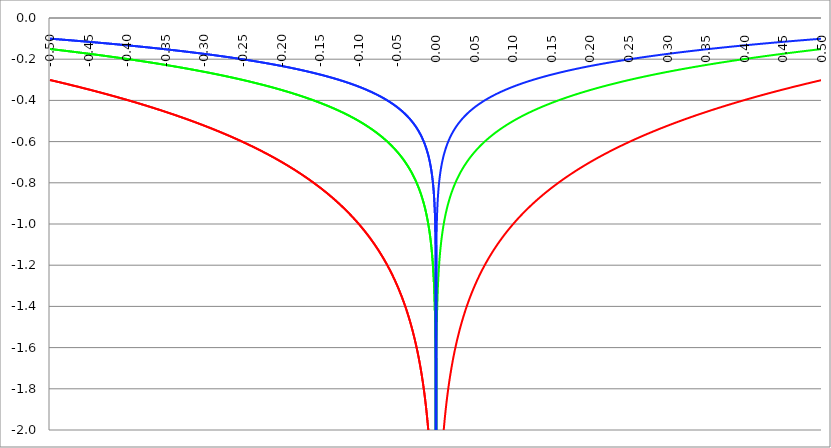
| Category | Series 1 | Series 0 | Series 2 |
|---|---|---|---|
| -0.5 | -0.301 | -0.151 | -0.1 |
| -0.4995 | -0.301 | -0.151 | -0.1 |
| -0.499 | -0.302 | -0.151 | -0.101 |
| -0.4985 | -0.302 | -0.151 | -0.101 |
| -0.498 | -0.303 | -0.151 | -0.101 |
| -0.4975 | -0.303 | -0.152 | -0.101 |
| -0.497 | -0.304 | -0.152 | -0.101 |
| -0.4965 | -0.304 | -0.152 | -0.101 |
| -0.496 | -0.305 | -0.152 | -0.102 |
| -0.4955 | -0.305 | -0.152 | -0.102 |
| -0.495 | -0.305 | -0.153 | -0.102 |
| -0.4945 | -0.306 | -0.153 | -0.102 |
| -0.494 | -0.306 | -0.153 | -0.102 |
| -0.4935 | -0.307 | -0.153 | -0.102 |
| -0.493 | -0.307 | -0.154 | -0.102 |
| -0.4925 | -0.308 | -0.154 | -0.103 |
| -0.492 | -0.308 | -0.154 | -0.103 |
| -0.4915 | -0.308 | -0.154 | -0.103 |
| -0.491 | -0.309 | -0.154 | -0.103 |
| -0.4905 | -0.309 | -0.155 | -0.103 |
| -0.49 | -0.31 | -0.155 | -0.103 |
| -0.4895 | -0.31 | -0.155 | -0.103 |
| -0.489 | -0.311 | -0.155 | -0.104 |
| -0.4885 | -0.311 | -0.156 | -0.104 |
| -0.488 | -0.312 | -0.156 | -0.104 |
| -0.4875 | -0.312 | -0.156 | -0.104 |
| -0.487 | -0.312 | -0.156 | -0.104 |
| -0.4865 | -0.313 | -0.156 | -0.104 |
| -0.486 | -0.313 | -0.157 | -0.104 |
| -0.4855 | -0.314 | -0.157 | -0.105 |
| -0.485 | -0.314 | -0.157 | -0.105 |
| -0.4845 | -0.315 | -0.157 | -0.105 |
| -0.484 | -0.315 | -0.158 | -0.105 |
| -0.4835 | -0.316 | -0.158 | -0.105 |
| -0.483 | -0.316 | -0.158 | -0.105 |
| -0.4825 | -0.317 | -0.158 | -0.106 |
| -0.482 | -0.317 | -0.158 | -0.106 |
| -0.4815 | -0.317 | -0.159 | -0.106 |
| -0.481 | -0.318 | -0.159 | -0.106 |
| -0.4805 | -0.318 | -0.159 | -0.106 |
| -0.48 | -0.319 | -0.159 | -0.106 |
| -0.4795 | -0.319 | -0.16 | -0.106 |
| -0.479 | -0.32 | -0.16 | -0.107 |
| -0.4785 | -0.32 | -0.16 | -0.107 |
| -0.478 | -0.321 | -0.16 | -0.107 |
| -0.4775 | -0.321 | -0.161 | -0.107 |
| -0.477 | -0.321 | -0.161 | -0.107 |
| -0.4765 | -0.322 | -0.161 | -0.107 |
| -0.476 | -0.322 | -0.161 | -0.107 |
| -0.4755 | -0.323 | -0.161 | -0.108 |
| -0.475 | -0.323 | -0.162 | -0.108 |
| -0.4745 | -0.324 | -0.162 | -0.108 |
| -0.474 | -0.324 | -0.162 | -0.108 |
| -0.4735 | -0.325 | -0.162 | -0.108 |
| -0.473 | -0.325 | -0.163 | -0.108 |
| -0.4725 | -0.326 | -0.163 | -0.109 |
| -0.472 | -0.326 | -0.163 | -0.109 |
| -0.4715 | -0.327 | -0.163 | -0.109 |
| -0.471 | -0.327 | -0.163 | -0.109 |
| -0.4705 | -0.327 | -0.164 | -0.109 |
| -0.47 | -0.328 | -0.164 | -0.109 |
| -0.4695 | -0.328 | -0.164 | -0.109 |
| -0.469 | -0.329 | -0.164 | -0.11 |
| -0.4685 | -0.329 | -0.165 | -0.11 |
| -0.468 | -0.33 | -0.165 | -0.11 |
| -0.4675 | -0.33 | -0.165 | -0.11 |
| -0.467 | -0.331 | -0.165 | -0.11 |
| -0.4665 | -0.331 | -0.166 | -0.11 |
| -0.466 | -0.332 | -0.166 | -0.111 |
| -0.4655 | -0.332 | -0.166 | -0.111 |
| -0.465 | -0.333 | -0.166 | -0.111 |
| -0.4645 | -0.333 | -0.167 | -0.111 |
| -0.464 | -0.333 | -0.167 | -0.111 |
| -0.4635 | -0.334 | -0.167 | -0.111 |
| -0.463 | -0.334 | -0.167 | -0.111 |
| -0.4625 | -0.335 | -0.167 | -0.112 |
| -0.462 | -0.335 | -0.168 | -0.112 |
| -0.4615 | -0.336 | -0.168 | -0.112 |
| -0.461 | -0.336 | -0.168 | -0.112 |
| -0.4605 | -0.337 | -0.168 | -0.112 |
| -0.46 | -0.337 | -0.169 | -0.112 |
| -0.4595 | -0.338 | -0.169 | -0.113 |
| -0.459 | -0.338 | -0.169 | -0.113 |
| -0.4585 | -0.339 | -0.169 | -0.113 |
| -0.458 | -0.339 | -0.17 | -0.113 |
| -0.4575 | -0.34 | -0.17 | -0.113 |
| -0.457 | -0.34 | -0.17 | -0.113 |
| -0.4565 | -0.341 | -0.17 | -0.114 |
| -0.456 | -0.341 | -0.171 | -0.114 |
| -0.4555 | -0.342 | -0.171 | -0.114 |
| -0.455 | -0.342 | -0.171 | -0.114 |
| -0.4545 | -0.342 | -0.171 | -0.114 |
| -0.454 | -0.343 | -0.171 | -0.114 |
| -0.4535 | -0.343 | -0.172 | -0.114 |
| -0.453 | -0.344 | -0.172 | -0.115 |
| -0.4525 | -0.344 | -0.172 | -0.115 |
| -0.452 | -0.345 | -0.172 | -0.115 |
| -0.4515 | -0.345 | -0.173 | -0.115 |
| -0.451 | -0.346 | -0.173 | -0.115 |
| -0.4505 | -0.346 | -0.173 | -0.115 |
| -0.45 | -0.347 | -0.173 | -0.116 |
| -0.4495 | -0.347 | -0.174 | -0.116 |
| -0.449 | -0.348 | -0.174 | -0.116 |
| -0.4485 | -0.348 | -0.174 | -0.116 |
| -0.448 | -0.349 | -0.174 | -0.116 |
| -0.4475 | -0.349 | -0.175 | -0.116 |
| -0.447 | -0.35 | -0.175 | -0.117 |
| -0.4465 | -0.35 | -0.175 | -0.117 |
| -0.446 | -0.351 | -0.175 | -0.117 |
| -0.4455 | -0.351 | -0.176 | -0.117 |
| -0.445 | -0.352 | -0.176 | -0.117 |
| -0.4445 | -0.352 | -0.176 | -0.117 |
| -0.444 | -0.353 | -0.176 | -0.118 |
| -0.4435 | -0.353 | -0.177 | -0.118 |
| -0.443 | -0.354 | -0.177 | -0.118 |
| -0.4425 | -0.354 | -0.177 | -0.118 |
| -0.442 | -0.355 | -0.177 | -0.118 |
| -0.4415 | -0.355 | -0.178 | -0.118 |
| -0.441 | -0.356 | -0.178 | -0.119 |
| -0.4405 | -0.356 | -0.178 | -0.119 |
| -0.44 | -0.357 | -0.178 | -0.119 |
| -0.4395 | -0.357 | -0.179 | -0.119 |
| -0.439 | -0.358 | -0.179 | -0.119 |
| -0.4385 | -0.358 | -0.179 | -0.119 |
| -0.438 | -0.359 | -0.179 | -0.12 |
| -0.4375 | -0.359 | -0.18 | -0.12 |
| -0.437 | -0.36 | -0.18 | -0.12 |
| -0.4365 | -0.36 | -0.18 | -0.12 |
| -0.436 | -0.361 | -0.18 | -0.12 |
| -0.4355 | -0.361 | -0.181 | -0.12 |
| -0.435 | -0.362 | -0.181 | -0.121 |
| -0.4345 | -0.362 | -0.181 | -0.121 |
| -0.434 | -0.363 | -0.181 | -0.121 |
| -0.4335 | -0.363 | -0.182 | -0.121 |
| -0.433 | -0.364 | -0.182 | -0.121 |
| -0.4325 | -0.364 | -0.182 | -0.121 |
| -0.432 | -0.365 | -0.182 | -0.122 |
| -0.4315 | -0.365 | -0.183 | -0.122 |
| -0.431 | -0.366 | -0.183 | -0.122 |
| -0.4305 | -0.366 | -0.183 | -0.122 |
| -0.43 | -0.367 | -0.183 | -0.122 |
| -0.4295 | -0.367 | -0.184 | -0.122 |
| -0.429 | -0.368 | -0.184 | -0.123 |
| -0.4285 | -0.368 | -0.184 | -0.123 |
| -0.428 | -0.369 | -0.184 | -0.123 |
| -0.4275 | -0.369 | -0.185 | -0.123 |
| -0.427 | -0.37 | -0.185 | -0.123 |
| -0.4265 | -0.37 | -0.185 | -0.123 |
| -0.426 | -0.371 | -0.185 | -0.124 |
| -0.4255 | -0.371 | -0.186 | -0.124 |
| -0.425 | -0.372 | -0.186 | -0.124 |
| -0.4245 | -0.372 | -0.186 | -0.124 |
| -0.424 | -0.373 | -0.186 | -0.124 |
| -0.4235 | -0.373 | -0.187 | -0.124 |
| -0.423 | -0.374 | -0.187 | -0.125 |
| -0.4225 | -0.374 | -0.187 | -0.125 |
| -0.422 | -0.375 | -0.187 | -0.125 |
| -0.4215 | -0.375 | -0.188 | -0.125 |
| -0.421 | -0.376 | -0.188 | -0.125 |
| -0.4205 | -0.376 | -0.188 | -0.125 |
| -0.42 | -0.377 | -0.188 | -0.126 |
| -0.4195 | -0.377 | -0.189 | -0.126 |
| -0.419 | -0.378 | -0.189 | -0.126 |
| -0.4185 | -0.378 | -0.189 | -0.126 |
| -0.418 | -0.379 | -0.189 | -0.126 |
| -0.4175 | -0.379 | -0.19 | -0.126 |
| -0.417 | -0.38 | -0.19 | -0.127 |
| -0.4165 | -0.38 | -0.19 | -0.127 |
| -0.416 | -0.381 | -0.19 | -0.127 |
| -0.4155 | -0.381 | -0.191 | -0.127 |
| -0.415 | -0.382 | -0.191 | -0.127 |
| -0.4145 | -0.382 | -0.191 | -0.127 |
| -0.414 | -0.383 | -0.191 | -0.128 |
| -0.4135 | -0.384 | -0.192 | -0.128 |
| -0.413 | -0.384 | -0.192 | -0.128 |
| -0.4125 | -0.385 | -0.192 | -0.128 |
| -0.412 | -0.385 | -0.193 | -0.128 |
| -0.4115 | -0.386 | -0.193 | -0.129 |
| -0.411 | -0.386 | -0.193 | -0.129 |
| -0.4105 | -0.387 | -0.193 | -0.129 |
| -0.41 | -0.387 | -0.194 | -0.129 |
| -0.4095 | -0.388 | -0.194 | -0.129 |
| -0.409 | -0.388 | -0.194 | -0.129 |
| -0.4085 | -0.389 | -0.194 | -0.13 |
| -0.408 | -0.389 | -0.195 | -0.13 |
| -0.4075 | -0.39 | -0.195 | -0.13 |
| -0.407 | -0.39 | -0.195 | -0.13 |
| -0.4065 | -0.391 | -0.195 | -0.13 |
| -0.406 | -0.391 | -0.196 | -0.13 |
| -0.4055 | -0.392 | -0.196 | -0.131 |
| -0.405 | -0.393 | -0.196 | -0.131 |
| -0.4045 | -0.393 | -0.197 | -0.131 |
| -0.404 | -0.394 | -0.197 | -0.131 |
| -0.4035 | -0.394 | -0.197 | -0.131 |
| -0.403 | -0.395 | -0.197 | -0.132 |
| -0.4025 | -0.395 | -0.198 | -0.132 |
| -0.402 | -0.396 | -0.198 | -0.132 |
| -0.4015 | -0.396 | -0.198 | -0.132 |
| -0.401 | -0.397 | -0.198 | -0.132 |
| -0.4005 | -0.397 | -0.199 | -0.132 |
| -0.4 | -0.398 | -0.199 | -0.133 |
| -0.3995 | -0.398 | -0.199 | -0.133 |
| -0.399 | -0.399 | -0.2 | -0.133 |
| -0.3985 | -0.4 | -0.2 | -0.133 |
| -0.398 | -0.4 | -0.2 | -0.133 |
| -0.3975 | -0.401 | -0.2 | -0.134 |
| -0.397 | -0.401 | -0.201 | -0.134 |
| -0.3965 | -0.402 | -0.201 | -0.134 |
| -0.396 | -0.402 | -0.201 | -0.134 |
| -0.3955 | -0.403 | -0.201 | -0.134 |
| -0.395 | -0.403 | -0.202 | -0.134 |
| -0.3945 | -0.404 | -0.202 | -0.135 |
| -0.394 | -0.405 | -0.202 | -0.135 |
| -0.3935 | -0.405 | -0.203 | -0.135 |
| -0.393 | -0.406 | -0.203 | -0.135 |
| -0.3925 | -0.406 | -0.203 | -0.135 |
| -0.392 | -0.407 | -0.203 | -0.136 |
| -0.3915 | -0.407 | -0.204 | -0.136 |
| -0.391 | -0.408 | -0.204 | -0.136 |
| -0.3905 | -0.408 | -0.204 | -0.136 |
| -0.39 | -0.409 | -0.204 | -0.136 |
| -0.3895 | -0.409 | -0.205 | -0.136 |
| -0.389 | -0.41 | -0.205 | -0.137 |
| -0.3885 | -0.411 | -0.205 | -0.137 |
| -0.388 | -0.411 | -0.206 | -0.137 |
| -0.3875 | -0.412 | -0.206 | -0.137 |
| -0.387 | -0.412 | -0.206 | -0.137 |
| -0.3865 | -0.413 | -0.206 | -0.138 |
| -0.386 | -0.413 | -0.207 | -0.138 |
| -0.3855 | -0.414 | -0.207 | -0.138 |
| -0.385 | -0.415 | -0.207 | -0.138 |
| -0.3845 | -0.415 | -0.208 | -0.138 |
| -0.384 | -0.416 | -0.208 | -0.139 |
| -0.3835 | -0.416 | -0.208 | -0.139 |
| -0.383 | -0.417 | -0.208 | -0.139 |
| -0.3825 | -0.417 | -0.209 | -0.139 |
| -0.382 | -0.418 | -0.209 | -0.139 |
| -0.3815 | -0.419 | -0.209 | -0.14 |
| -0.381 | -0.419 | -0.21 | -0.14 |
| -0.3805 | -0.42 | -0.21 | -0.14 |
| -0.38 | -0.42 | -0.21 | -0.14 |
| -0.3795 | -0.421 | -0.21 | -0.14 |
| -0.379 | -0.421 | -0.211 | -0.14 |
| -0.3785 | -0.422 | -0.211 | -0.141 |
| -0.378 | -0.423 | -0.211 | -0.141 |
| -0.3775 | -0.423 | -0.212 | -0.141 |
| -0.377 | -0.424 | -0.212 | -0.141 |
| -0.3765 | -0.424 | -0.212 | -0.141 |
| -0.376 | -0.425 | -0.212 | -0.142 |
| -0.3755 | -0.425 | -0.213 | -0.142 |
| -0.375 | -0.426 | -0.213 | -0.142 |
| -0.3745 | -0.427 | -0.213 | -0.142 |
| -0.374 | -0.427 | -0.214 | -0.142 |
| -0.3735 | -0.428 | -0.214 | -0.143 |
| -0.373 | -0.428 | -0.214 | -0.143 |
| -0.3725 | -0.429 | -0.214 | -0.143 |
| -0.372 | -0.429 | -0.215 | -0.143 |
| -0.3715 | -0.43 | -0.215 | -0.143 |
| -0.371 | -0.431 | -0.215 | -0.144 |
| -0.3705 | -0.431 | -0.216 | -0.144 |
| -0.37 | -0.432 | -0.216 | -0.144 |
| -0.3695 | -0.432 | -0.216 | -0.144 |
| -0.369 | -0.433 | -0.216 | -0.144 |
| -0.3685 | -0.434 | -0.217 | -0.145 |
| -0.368 | -0.434 | -0.217 | -0.145 |
| -0.3675 | -0.435 | -0.217 | -0.145 |
| -0.367 | -0.435 | -0.218 | -0.145 |
| -0.3665 | -0.436 | -0.218 | -0.145 |
| -0.366 | -0.437 | -0.218 | -0.146 |
| -0.3655 | -0.437 | -0.219 | -0.146 |
| -0.365 | -0.438 | -0.219 | -0.146 |
| -0.3645 | -0.438 | -0.219 | -0.146 |
| -0.364 | -0.439 | -0.219 | -0.146 |
| -0.3635 | -0.439 | -0.22 | -0.146 |
| -0.363 | -0.44 | -0.22 | -0.147 |
| -0.3625 | -0.441 | -0.22 | -0.147 |
| -0.362 | -0.441 | -0.221 | -0.147 |
| -0.3615 | -0.442 | -0.221 | -0.147 |
| -0.361 | -0.442 | -0.221 | -0.147 |
| -0.3605 | -0.443 | -0.222 | -0.148 |
| -0.36 | -0.444 | -0.222 | -0.148 |
| -0.3595 | -0.444 | -0.222 | -0.148 |
| -0.359 | -0.445 | -0.222 | -0.148 |
| -0.3585 | -0.446 | -0.223 | -0.149 |
| -0.358 | -0.446 | -0.223 | -0.149 |
| -0.3575 | -0.447 | -0.223 | -0.149 |
| -0.357 | -0.447 | -0.224 | -0.149 |
| -0.3565 | -0.448 | -0.224 | -0.149 |
| -0.356 | -0.449 | -0.224 | -0.15 |
| -0.3555 | -0.449 | -0.225 | -0.15 |
| -0.355 | -0.45 | -0.225 | -0.15 |
| -0.3545 | -0.45 | -0.225 | -0.15 |
| -0.354 | -0.451 | -0.225 | -0.15 |
| -0.3535 | -0.452 | -0.226 | -0.151 |
| -0.353 | -0.452 | -0.226 | -0.151 |
| -0.3525 | -0.453 | -0.226 | -0.151 |
| -0.352 | -0.453 | -0.227 | -0.151 |
| -0.3515 | -0.454 | -0.227 | -0.151 |
| -0.351 | -0.455 | -0.227 | -0.152 |
| -0.3505 | -0.455 | -0.228 | -0.152 |
| -0.35 | -0.456 | -0.228 | -0.152 |
| -0.3495 | -0.457 | -0.228 | -0.152 |
| -0.349 | -0.457 | -0.229 | -0.152 |
| -0.3485 | -0.458 | -0.229 | -0.153 |
| -0.348 | -0.458 | -0.229 | -0.153 |
| -0.3475 | -0.459 | -0.23 | -0.153 |
| -0.347 | -0.46 | -0.23 | -0.153 |
| -0.3465 | -0.46 | -0.23 | -0.153 |
| -0.346 | -0.461 | -0.23 | -0.154 |
| -0.3455 | -0.462 | -0.231 | -0.154 |
| -0.345 | -0.462 | -0.231 | -0.154 |
| -0.3445 | -0.463 | -0.231 | -0.154 |
| -0.344 | -0.463 | -0.232 | -0.154 |
| -0.3435 | -0.464 | -0.232 | -0.155 |
| -0.343 | -0.465 | -0.232 | -0.155 |
| -0.3425 | -0.465 | -0.233 | -0.155 |
| -0.342 | -0.466 | -0.233 | -0.155 |
| -0.3415 | -0.467 | -0.233 | -0.156 |
| -0.341 | -0.467 | -0.234 | -0.156 |
| -0.3405 | -0.468 | -0.234 | -0.156 |
| -0.34 | -0.469 | -0.234 | -0.156 |
| -0.3395 | -0.469 | -0.235 | -0.156 |
| -0.339 | -0.47 | -0.235 | -0.157 |
| -0.3385 | -0.47 | -0.235 | -0.157 |
| -0.338 | -0.471 | -0.236 | -0.157 |
| -0.3375 | -0.472 | -0.236 | -0.157 |
| -0.337 | -0.472 | -0.236 | -0.157 |
| -0.3365 | -0.473 | -0.237 | -0.158 |
| -0.336 | -0.474 | -0.237 | -0.158 |
| -0.3355 | -0.474 | -0.237 | -0.158 |
| -0.335 | -0.475 | -0.237 | -0.158 |
| -0.3345 | -0.476 | -0.238 | -0.159 |
| -0.334 | -0.476 | -0.238 | -0.159 |
| -0.3335 | -0.477 | -0.238 | -0.159 |
| -0.333 | -0.478 | -0.239 | -0.159 |
| -0.3325 | -0.478 | -0.239 | -0.159 |
| -0.332 | -0.479 | -0.239 | -0.16 |
| -0.3315 | -0.48 | -0.24 | -0.16 |
| -0.331 | -0.48 | -0.24 | -0.16 |
| -0.3305 | -0.481 | -0.24 | -0.16 |
| -0.33 | -0.481 | -0.241 | -0.16 |
| -0.3295 | -0.482 | -0.241 | -0.161 |
| -0.329 | -0.483 | -0.241 | -0.161 |
| -0.3285 | -0.483 | -0.242 | -0.161 |
| -0.328 | -0.484 | -0.242 | -0.161 |
| -0.3275 | -0.485 | -0.242 | -0.162 |
| -0.327 | -0.485 | -0.243 | -0.162 |
| -0.3265 | -0.486 | -0.243 | -0.162 |
| -0.326 | -0.487 | -0.243 | -0.162 |
| -0.3255 | -0.487 | -0.244 | -0.162 |
| -0.325 | -0.488 | -0.244 | -0.163 |
| -0.3245 | -0.489 | -0.244 | -0.163 |
| -0.324 | -0.489 | -0.245 | -0.163 |
| -0.3235 | -0.49 | -0.245 | -0.163 |
| -0.323 | -0.491 | -0.245 | -0.164 |
| -0.3225 | -0.491 | -0.246 | -0.164 |
| -0.322 | -0.492 | -0.246 | -0.164 |
| -0.3215 | -0.493 | -0.246 | -0.164 |
| -0.321 | -0.493 | -0.247 | -0.164 |
| -0.3205 | -0.494 | -0.247 | -0.165 |
| -0.32 | -0.495 | -0.247 | -0.165 |
| -0.3195 | -0.496 | -0.248 | -0.165 |
| -0.319 | -0.496 | -0.248 | -0.165 |
| -0.3185 | -0.497 | -0.248 | -0.166 |
| -0.318 | -0.498 | -0.249 | -0.166 |
| -0.3175 | -0.498 | -0.249 | -0.166 |
| -0.317 | -0.499 | -0.249 | -0.166 |
| -0.3165 | -0.5 | -0.25 | -0.167 |
| -0.316 | -0.5 | -0.25 | -0.167 |
| -0.3155 | -0.501 | -0.251 | -0.167 |
| -0.315 | -0.502 | -0.251 | -0.167 |
| -0.3145 | -0.502 | -0.251 | -0.167 |
| -0.314 | -0.503 | -0.252 | -0.168 |
| -0.3135 | -0.504 | -0.252 | -0.168 |
| -0.313 | -0.504 | -0.252 | -0.168 |
| -0.3125 | -0.505 | -0.253 | -0.168 |
| -0.312 | -0.506 | -0.253 | -0.169 |
| -0.3115 | -0.507 | -0.253 | -0.169 |
| -0.311 | -0.507 | -0.254 | -0.169 |
| -0.3105 | -0.508 | -0.254 | -0.169 |
| -0.31 | -0.509 | -0.254 | -0.17 |
| -0.3095 | -0.509 | -0.255 | -0.17 |
| -0.309 | -0.51 | -0.255 | -0.17 |
| -0.3085 | -0.511 | -0.255 | -0.17 |
| -0.308 | -0.511 | -0.256 | -0.17 |
| -0.3075 | -0.512 | -0.256 | -0.171 |
| -0.307 | -0.513 | -0.256 | -0.171 |
| -0.3065 | -0.514 | -0.257 | -0.171 |
| -0.306 | -0.514 | -0.257 | -0.171 |
| -0.3055 | -0.515 | -0.257 | -0.172 |
| -0.305 | -0.516 | -0.258 | -0.172 |
| -0.3045 | -0.516 | -0.258 | -0.172 |
| -0.304 | -0.517 | -0.259 | -0.172 |
| -0.3035 | -0.518 | -0.259 | -0.173 |
| -0.303 | -0.519 | -0.259 | -0.173 |
| -0.3025 | -0.519 | -0.26 | -0.173 |
| -0.302 | -0.52 | -0.26 | -0.173 |
| -0.3015 | -0.521 | -0.26 | -0.174 |
| -0.301 | -0.521 | -0.261 | -0.174 |
| -0.3005 | -0.522 | -0.261 | -0.174 |
| -0.3 | -0.523 | -0.261 | -0.174 |
| -0.2995 | -0.524 | -0.262 | -0.175 |
| -0.299 | -0.524 | -0.262 | -0.175 |
| -0.2985 | -0.525 | -0.263 | -0.175 |
| -0.298 | -0.526 | -0.263 | -0.175 |
| -0.2975 | -0.527 | -0.263 | -0.176 |
| -0.297 | -0.527 | -0.264 | -0.176 |
| -0.2965 | -0.528 | -0.264 | -0.176 |
| -0.296 | -0.529 | -0.264 | -0.176 |
| -0.2955 | -0.529 | -0.265 | -0.176 |
| -0.295 | -0.53 | -0.265 | -0.177 |
| -0.2945 | -0.531 | -0.265 | -0.177 |
| -0.294 | -0.532 | -0.266 | -0.177 |
| -0.2935 | -0.532 | -0.266 | -0.177 |
| -0.293 | -0.533 | -0.267 | -0.178 |
| -0.2925 | -0.534 | -0.267 | -0.178 |
| -0.292 | -0.535 | -0.267 | -0.178 |
| -0.2915 | -0.535 | -0.268 | -0.178 |
| -0.291 | -0.536 | -0.268 | -0.179 |
| -0.2905 | -0.537 | -0.268 | -0.179 |
| -0.29 | -0.538 | -0.269 | -0.179 |
| -0.2895 | -0.538 | -0.269 | -0.179 |
| -0.289 | -0.539 | -0.27 | -0.18 |
| -0.2885 | -0.54 | -0.27 | -0.18 |
| -0.288 | -0.541 | -0.27 | -0.18 |
| -0.2875 | -0.541 | -0.271 | -0.18 |
| -0.287 | -0.542 | -0.271 | -0.181 |
| -0.2865 | -0.543 | -0.271 | -0.181 |
| -0.286 | -0.544 | -0.272 | -0.181 |
| -0.2855 | -0.544 | -0.272 | -0.181 |
| -0.285 | -0.545 | -0.273 | -0.182 |
| -0.2845 | -0.546 | -0.273 | -0.182 |
| -0.284 | -0.547 | -0.273 | -0.182 |
| -0.2835 | -0.547 | -0.274 | -0.182 |
| -0.283 | -0.548 | -0.274 | -0.183 |
| -0.2825 | -0.549 | -0.274 | -0.183 |
| -0.282 | -0.55 | -0.275 | -0.183 |
| -0.2815 | -0.551 | -0.275 | -0.184 |
| -0.281 | -0.551 | -0.276 | -0.184 |
| -0.2805 | -0.552 | -0.276 | -0.184 |
| -0.28 | -0.553 | -0.276 | -0.184 |
| -0.2795 | -0.554 | -0.277 | -0.185 |
| -0.279 | -0.554 | -0.277 | -0.185 |
| -0.2785 | -0.555 | -0.278 | -0.185 |
| -0.278 | -0.556 | -0.278 | -0.185 |
| -0.2775 | -0.557 | -0.278 | -0.186 |
| -0.277 | -0.558 | -0.279 | -0.186 |
| -0.2765 | -0.558 | -0.279 | -0.186 |
| -0.276 | -0.559 | -0.28 | -0.186 |
| -0.2755 | -0.56 | -0.28 | -0.187 |
| -0.275 | -0.561 | -0.28 | -0.187 |
| -0.2745 | -0.561 | -0.281 | -0.187 |
| -0.274 | -0.562 | -0.281 | -0.187 |
| -0.2735 | -0.563 | -0.282 | -0.188 |
| -0.273 | -0.564 | -0.282 | -0.188 |
| -0.2725 | -0.565 | -0.282 | -0.188 |
| -0.272 | -0.565 | -0.283 | -0.188 |
| -0.2715 | -0.566 | -0.283 | -0.189 |
| -0.271 | -0.567 | -0.284 | -0.189 |
| -0.2705 | -0.568 | -0.284 | -0.189 |
| -0.27 | -0.569 | -0.284 | -0.19 |
| -0.2695 | -0.569 | -0.285 | -0.19 |
| -0.269 | -0.57 | -0.285 | -0.19 |
| -0.2685 | -0.571 | -0.286 | -0.19 |
| -0.268 | -0.572 | -0.286 | -0.191 |
| -0.2675 | -0.573 | -0.286 | -0.191 |
| -0.267 | -0.573 | -0.287 | -0.191 |
| -0.2665 | -0.574 | -0.287 | -0.191 |
| -0.266 | -0.575 | -0.288 | -0.192 |
| -0.2655 | -0.576 | -0.288 | -0.192 |
| -0.265 | -0.577 | -0.288 | -0.192 |
| -0.2645 | -0.578 | -0.289 | -0.193 |
| -0.264 | -0.578 | -0.289 | -0.193 |
| -0.2635 | -0.579 | -0.29 | -0.193 |
| -0.263 | -0.58 | -0.29 | -0.193 |
| -0.2625 | -0.581 | -0.29 | -0.194 |
| -0.262 | -0.582 | -0.291 | -0.194 |
| -0.2615 | -0.583 | -0.291 | -0.194 |
| -0.261 | -0.583 | -0.292 | -0.194 |
| -0.2605 | -0.584 | -0.292 | -0.195 |
| -0.26 | -0.585 | -0.293 | -0.195 |
| -0.2595 | -0.586 | -0.293 | -0.195 |
| -0.259 | -0.587 | -0.293 | -0.196 |
| -0.2585 | -0.588 | -0.294 | -0.196 |
| -0.258 | -0.588 | -0.294 | -0.196 |
| -0.2575 | -0.589 | -0.295 | -0.196 |
| -0.257 | -0.59 | -0.295 | -0.197 |
| -0.2565 | -0.591 | -0.295 | -0.197 |
| -0.256 | -0.592 | -0.296 | -0.197 |
| -0.2555 | -0.593 | -0.296 | -0.198 |
| -0.255 | -0.593 | -0.297 | -0.198 |
| -0.2545 | -0.594 | -0.297 | -0.198 |
| -0.254 | -0.595 | -0.298 | -0.198 |
| -0.2535 | -0.596 | -0.298 | -0.199 |
| -0.253 | -0.597 | -0.298 | -0.199 |
| -0.2525 | -0.598 | -0.299 | -0.199 |
| -0.252 | -0.599 | -0.299 | -0.2 |
| -0.2515 | -0.599 | -0.3 | -0.2 |
| -0.251 | -0.6 | -0.3 | -0.2 |
| -0.2505 | -0.601 | -0.301 | -0.2 |
| -0.25 | -0.602 | -0.301 | -0.201 |
| -0.2495 | -0.603 | -0.301 | -0.201 |
| -0.249 | -0.604 | -0.302 | -0.201 |
| -0.2485 | -0.605 | -0.302 | -0.202 |
| -0.248 | -0.606 | -0.303 | -0.202 |
| -0.2475 | -0.606 | -0.303 | -0.202 |
| -0.247 | -0.607 | -0.304 | -0.202 |
| -0.2465 | -0.608 | -0.304 | -0.203 |
| -0.246 | -0.609 | -0.305 | -0.203 |
| -0.2455 | -0.61 | -0.305 | -0.203 |
| -0.245 | -0.611 | -0.305 | -0.204 |
| -0.2445 | -0.612 | -0.306 | -0.204 |
| -0.244 | -0.613 | -0.306 | -0.204 |
| -0.2435 | -0.614 | -0.307 | -0.205 |
| -0.243 | -0.614 | -0.307 | -0.205 |
| -0.2425 | -0.615 | -0.308 | -0.205 |
| -0.242 | -0.616 | -0.308 | -0.205 |
| -0.2415 | -0.617 | -0.309 | -0.206 |
| -0.241 | -0.618 | -0.309 | -0.206 |
| -0.2405 | -0.619 | -0.309 | -0.206 |
| -0.24 | -0.62 | -0.31 | -0.207 |
| -0.2395 | -0.621 | -0.31 | -0.207 |
| -0.239 | -0.622 | -0.311 | -0.207 |
| -0.2385 | -0.623 | -0.311 | -0.208 |
| -0.238 | -0.623 | -0.312 | -0.208 |
| -0.2375 | -0.624 | -0.312 | -0.208 |
| -0.237 | -0.625 | -0.313 | -0.208 |
| -0.2365 | -0.626 | -0.313 | -0.209 |
| -0.236 | -0.627 | -0.314 | -0.209 |
| -0.2355 | -0.628 | -0.314 | -0.209 |
| -0.235 | -0.629 | -0.314 | -0.21 |
| -0.2345 | -0.63 | -0.315 | -0.21 |
| -0.234 | -0.631 | -0.315 | -0.21 |
| -0.2335 | -0.632 | -0.316 | -0.211 |
| -0.233 | -0.633 | -0.316 | -0.211 |
| -0.2325 | -0.634 | -0.317 | -0.211 |
| -0.232 | -0.635 | -0.317 | -0.212 |
| -0.2315 | -0.635 | -0.318 | -0.212 |
| -0.231 | -0.636 | -0.318 | -0.212 |
| -0.2305 | -0.637 | -0.319 | -0.212 |
| -0.23 | -0.638 | -0.319 | -0.213 |
| -0.2295 | -0.639 | -0.32 | -0.213 |
| -0.229 | -0.64 | -0.32 | -0.213 |
| -0.2285 | -0.641 | -0.321 | -0.214 |
| -0.228 | -0.642 | -0.321 | -0.214 |
| -0.2275 | -0.643 | -0.322 | -0.214 |
| -0.227 | -0.644 | -0.322 | -0.215 |
| -0.2265 | -0.645 | -0.322 | -0.215 |
| -0.226 | -0.646 | -0.323 | -0.215 |
| -0.2255 | -0.647 | -0.323 | -0.216 |
| -0.225 | -0.648 | -0.324 | -0.216 |
| -0.2245 | -0.649 | -0.324 | -0.216 |
| -0.224 | -0.65 | -0.325 | -0.217 |
| -0.2235 | -0.651 | -0.325 | -0.217 |
| -0.223 | -0.652 | -0.326 | -0.217 |
| -0.2225 | -0.653 | -0.326 | -0.218 |
| -0.222 | -0.654 | -0.327 | -0.218 |
| -0.2215 | -0.655 | -0.327 | -0.218 |
| -0.221 | -0.656 | -0.328 | -0.219 |
| -0.2205 | -0.657 | -0.328 | -0.219 |
| -0.22 | -0.658 | -0.329 | -0.219 |
| -0.2195 | -0.659 | -0.329 | -0.22 |
| -0.219 | -0.66 | -0.33 | -0.22 |
| -0.2185 | -0.661 | -0.33 | -0.22 |
| -0.218 | -0.662 | -0.331 | -0.221 |
| -0.2175 | -0.663 | -0.331 | -0.221 |
| -0.217 | -0.664 | -0.332 | -0.221 |
| -0.2165 | -0.665 | -0.332 | -0.222 |
| -0.216 | -0.666 | -0.333 | -0.222 |
| -0.2155 | -0.667 | -0.333 | -0.222 |
| -0.215 | -0.668 | -0.334 | -0.223 |
| -0.2145 | -0.669 | -0.334 | -0.223 |
| -0.214 | -0.67 | -0.335 | -0.223 |
| -0.2135 | -0.671 | -0.335 | -0.224 |
| -0.213 | -0.672 | -0.336 | -0.224 |
| -0.2125 | -0.673 | -0.336 | -0.224 |
| -0.212 | -0.674 | -0.337 | -0.225 |
| -0.2115 | -0.675 | -0.337 | -0.225 |
| -0.211 | -0.676 | -0.338 | -0.225 |
| -0.2105 | -0.677 | -0.338 | -0.226 |
| -0.21 | -0.678 | -0.339 | -0.226 |
| -0.2095 | -0.679 | -0.339 | -0.226 |
| -0.209 | -0.68 | -0.34 | -0.227 |
| -0.2085 | -0.681 | -0.34 | -0.227 |
| -0.208 | -0.682 | -0.341 | -0.227 |
| -0.2075 | -0.683 | -0.341 | -0.228 |
| -0.207 | -0.684 | -0.342 | -0.228 |
| -0.2065 | -0.685 | -0.343 | -0.228 |
| -0.206 | -0.686 | -0.343 | -0.229 |
| -0.2055 | -0.687 | -0.344 | -0.229 |
| -0.205 | -0.688 | -0.344 | -0.229 |
| -0.2045 | -0.689 | -0.345 | -0.23 |
| -0.204 | -0.69 | -0.345 | -0.23 |
| -0.2035 | -0.691 | -0.346 | -0.23 |
| -0.203 | -0.693 | -0.346 | -0.231 |
| -0.2025 | -0.694 | -0.347 | -0.231 |
| -0.202 | -0.695 | -0.347 | -0.232 |
| -0.2015 | -0.696 | -0.348 | -0.232 |
| -0.201 | -0.697 | -0.348 | -0.232 |
| -0.2005 | -0.698 | -0.349 | -0.233 |
| -0.2 | -0.699 | -0.349 | -0.233 |
| -0.1995 | -0.7 | -0.35 | -0.233 |
| -0.199 | -0.701 | -0.351 | -0.234 |
| -0.1985 | -0.702 | -0.351 | -0.234 |
| -0.198 | -0.703 | -0.352 | -0.234 |
| -0.1975 | -0.704 | -0.352 | -0.235 |
| -0.197 | -0.706 | -0.353 | -0.235 |
| -0.1965 | -0.707 | -0.353 | -0.236 |
| -0.196 | -0.708 | -0.354 | -0.236 |
| -0.1955 | -0.709 | -0.354 | -0.236 |
| -0.195 | -0.71 | -0.355 | -0.237 |
| -0.1945 | -0.711 | -0.356 | -0.237 |
| -0.194 | -0.712 | -0.356 | -0.237 |
| -0.1935 | -0.713 | -0.357 | -0.238 |
| -0.193 | -0.714 | -0.357 | -0.238 |
| -0.1925 | -0.716 | -0.358 | -0.239 |
| -0.192 | -0.717 | -0.358 | -0.239 |
| -0.1915 | -0.718 | -0.359 | -0.239 |
| -0.191 | -0.719 | -0.359 | -0.24 |
| -0.1905 | -0.72 | -0.36 | -0.24 |
| -0.19 | -0.721 | -0.361 | -0.24 |
| -0.1895 | -0.722 | -0.361 | -0.241 |
| -0.189 | -0.724 | -0.362 | -0.241 |
| -0.1885 | -0.725 | -0.362 | -0.242 |
| -0.188 | -0.726 | -0.363 | -0.242 |
| -0.1875 | -0.727 | -0.363 | -0.242 |
| -0.187 | -0.728 | -0.364 | -0.243 |
| -0.1865 | -0.729 | -0.365 | -0.243 |
| -0.186 | -0.73 | -0.365 | -0.243 |
| -0.1855 | -0.732 | -0.366 | -0.244 |
| -0.185 | -0.733 | -0.366 | -0.244 |
| -0.1845 | -0.734 | -0.367 | -0.245 |
| -0.184 | -0.735 | -0.368 | -0.245 |
| -0.1835 | -0.736 | -0.368 | -0.245 |
| -0.183 | -0.738 | -0.369 | -0.246 |
| -0.1825 | -0.739 | -0.369 | -0.246 |
| -0.182 | -0.74 | -0.37 | -0.247 |
| -0.1815 | -0.741 | -0.371 | -0.247 |
| -0.181 | -0.742 | -0.371 | -0.247 |
| -0.1805 | -0.744 | -0.372 | -0.248 |
| -0.18 | -0.745 | -0.372 | -0.248 |
| -0.1795 | -0.746 | -0.373 | -0.249 |
| -0.179 | -0.747 | -0.374 | -0.249 |
| -0.1785 | -0.748 | -0.374 | -0.249 |
| -0.178 | -0.75 | -0.375 | -0.25 |
| -0.1775 | -0.751 | -0.375 | -0.25 |
| -0.177 | -0.752 | -0.376 | -0.251 |
| -0.1765 | -0.753 | -0.377 | -0.251 |
| -0.176 | -0.754 | -0.377 | -0.251 |
| -0.1755 | -0.756 | -0.378 | -0.252 |
| -0.175 | -0.757 | -0.378 | -0.252 |
| -0.1745 | -0.758 | -0.379 | -0.253 |
| -0.174 | -0.759 | -0.38 | -0.253 |
| -0.1735 | -0.761 | -0.38 | -0.254 |
| -0.173 | -0.762 | -0.381 | -0.254 |
| -0.1725 | -0.763 | -0.382 | -0.254 |
| -0.172 | -0.764 | -0.382 | -0.255 |
| -0.1715 | -0.766 | -0.383 | -0.255 |
| -0.171 | -0.767 | -0.384 | -0.256 |
| -0.1705 | -0.768 | -0.384 | -0.256 |
| -0.17 | -0.77 | -0.385 | -0.257 |
| -0.1695 | -0.771 | -0.385 | -0.257 |
| -0.169 | -0.772 | -0.386 | -0.257 |
| -0.1685 | -0.773 | -0.387 | -0.258 |
| -0.168 | -0.775 | -0.387 | -0.258 |
| -0.1675 | -0.776 | -0.388 | -0.259 |
| -0.167 | -0.777 | -0.389 | -0.259 |
| -0.1665 | -0.779 | -0.389 | -0.26 |
| -0.166 | -0.78 | -0.39 | -0.26 |
| -0.1655 | -0.781 | -0.391 | -0.26 |
| -0.165 | -0.783 | -0.391 | -0.261 |
| -0.1645 | -0.784 | -0.392 | -0.261 |
| -0.164 | -0.785 | -0.393 | -0.262 |
| -0.1635 | -0.786 | -0.393 | -0.262 |
| -0.163 | -0.788 | -0.394 | -0.263 |
| -0.1625 | -0.789 | -0.395 | -0.263 |
| -0.162 | -0.79 | -0.395 | -0.263 |
| -0.1615 | -0.792 | -0.396 | -0.264 |
| -0.161 | -0.793 | -0.397 | -0.264 |
| -0.1605 | -0.795 | -0.397 | -0.265 |
| -0.16 | -0.796 | -0.398 | -0.265 |
| -0.1595 | -0.797 | -0.399 | -0.266 |
| -0.159 | -0.799 | -0.399 | -0.266 |
| -0.1585 | -0.8 | -0.4 | -0.267 |
| -0.158 | -0.801 | -0.401 | -0.267 |
| -0.1575 | -0.803 | -0.401 | -0.268 |
| -0.157 | -0.804 | -0.402 | -0.268 |
| -0.1565 | -0.805 | -0.403 | -0.268 |
| -0.156 | -0.807 | -0.403 | -0.269 |
| -0.1555 | -0.808 | -0.404 | -0.269 |
| -0.155 | -0.81 | -0.405 | -0.27 |
| -0.1545 | -0.811 | -0.406 | -0.27 |
| -0.154 | -0.812 | -0.406 | -0.271 |
| -0.1535 | -0.814 | -0.407 | -0.271 |
| -0.153 | -0.815 | -0.408 | -0.272 |
| -0.1525 | -0.817 | -0.408 | -0.272 |
| -0.152 | -0.818 | -0.409 | -0.273 |
| -0.1515 | -0.82 | -0.41 | -0.273 |
| -0.151 | -0.821 | -0.411 | -0.274 |
| -0.1505 | -0.822 | -0.411 | -0.274 |
| -0.15 | -0.824 | -0.412 | -0.275 |
| -0.1495 | -0.825 | -0.413 | -0.275 |
| -0.149 | -0.827 | -0.413 | -0.276 |
| -0.1485 | -0.828 | -0.414 | -0.276 |
| -0.148 | -0.83 | -0.415 | -0.277 |
| -0.1475 | -0.831 | -0.416 | -0.277 |
| -0.147 | -0.833 | -0.416 | -0.278 |
| -0.1465 | -0.834 | -0.417 | -0.278 |
| -0.146 | -0.836 | -0.418 | -0.279 |
| -0.1455 | -0.837 | -0.419 | -0.279 |
| -0.145 | -0.839 | -0.419 | -0.28 |
| -0.1445 | -0.84 | -0.42 | -0.28 |
| -0.144 | -0.842 | -0.421 | -0.281 |
| -0.1435 | -0.843 | -0.422 | -0.281 |
| -0.143 | -0.845 | -0.422 | -0.282 |
| -0.1425 | -0.846 | -0.423 | -0.282 |
| -0.142 | -0.848 | -0.424 | -0.283 |
| -0.1415 | -0.849 | -0.425 | -0.283 |
| -0.141 | -0.851 | -0.425 | -0.284 |
| -0.1405 | -0.852 | -0.426 | -0.284 |
| -0.14 | -0.854 | -0.427 | -0.285 |
| -0.1395 | -0.855 | -0.428 | -0.285 |
| -0.139 | -0.857 | -0.428 | -0.286 |
| -0.1385 | -0.859 | -0.429 | -0.286 |
| -0.138 | -0.86 | -0.43 | -0.287 |
| -0.1375 | -0.862 | -0.431 | -0.287 |
| -0.137 | -0.863 | -0.432 | -0.288 |
| -0.1365 | -0.865 | -0.432 | -0.288 |
| -0.136 | -0.866 | -0.433 | -0.289 |
| -0.1355 | -0.868 | -0.434 | -0.289 |
| -0.135 | -0.87 | -0.435 | -0.29 |
| -0.1345 | -0.871 | -0.436 | -0.29 |
| -0.134 | -0.873 | -0.436 | -0.291 |
| -0.1335 | -0.875 | -0.437 | -0.292 |
| -0.133 | -0.876 | -0.438 | -0.292 |
| -0.1325 | -0.878 | -0.439 | -0.293 |
| -0.132 | -0.879 | -0.44 | -0.293 |
| -0.1315 | -0.881 | -0.441 | -0.294 |
| -0.131 | -0.883 | -0.441 | -0.294 |
| -0.1305 | -0.884 | -0.442 | -0.295 |
| -0.13 | -0.886 | -0.443 | -0.295 |
| -0.1295 | -0.888 | -0.444 | -0.296 |
| -0.129 | -0.889 | -0.445 | -0.296 |
| -0.1285 | -0.891 | -0.446 | -0.297 |
| -0.128 | -0.893 | -0.446 | -0.298 |
| -0.1275 | -0.894 | -0.447 | -0.298 |
| -0.127 | -0.896 | -0.448 | -0.299 |
| -0.1265 | -0.898 | -0.449 | -0.299 |
| -0.126 | -0.9 | -0.45 | -0.3 |
| -0.1255 | -0.901 | -0.451 | -0.3 |
| -0.125 | -0.903 | -0.452 | -0.301 |
| -0.1245 | -0.905 | -0.452 | -0.302 |
| -0.124 | -0.907 | -0.453 | -0.302 |
| -0.1235 | -0.908 | -0.454 | -0.303 |
| -0.123 | -0.91 | -0.455 | -0.303 |
| -0.1225 | -0.912 | -0.456 | -0.304 |
| -0.122 | -0.914 | -0.457 | -0.305 |
| -0.1215 | -0.915 | -0.458 | -0.305 |
| -0.121 | -0.917 | -0.459 | -0.306 |
| -0.1205 | -0.919 | -0.46 | -0.306 |
| -0.12 | -0.921 | -0.46 | -0.307 |
| -0.1195 | -0.923 | -0.461 | -0.308 |
| -0.119 | -0.924 | -0.462 | -0.308 |
| -0.1185 | -0.926 | -0.463 | -0.309 |
| -0.118 | -0.928 | -0.464 | -0.309 |
| -0.1175 | -0.93 | -0.465 | -0.31 |
| -0.117 | -0.932 | -0.466 | -0.311 |
| -0.1165 | -0.934 | -0.467 | -0.311 |
| -0.116 | -0.936 | -0.468 | -0.312 |
| -0.1155 | -0.937 | -0.469 | -0.312 |
| -0.115 | -0.939 | -0.47 | -0.313 |
| -0.1145 | -0.941 | -0.471 | -0.314 |
| -0.114 | -0.943 | -0.472 | -0.314 |
| -0.1135 | -0.945 | -0.473 | -0.315 |
| -0.113 | -0.947 | -0.473 | -0.316 |
| -0.1125 | -0.949 | -0.474 | -0.316 |
| -0.112 | -0.951 | -0.475 | -0.317 |
| -0.1115 | -0.953 | -0.476 | -0.318 |
| -0.111 | -0.955 | -0.477 | -0.318 |
| -0.1105 | -0.957 | -0.478 | -0.319 |
| -0.11 | -0.959 | -0.479 | -0.32 |
| -0.1095 | -0.961 | -0.48 | -0.32 |
| -0.109 | -0.963 | -0.481 | -0.321 |
| -0.1085 | -0.965 | -0.482 | -0.322 |
| -0.108 | -0.967 | -0.483 | -0.322 |
| -0.1075 | -0.969 | -0.484 | -0.323 |
| -0.107 | -0.971 | -0.485 | -0.324 |
| -0.1065 | -0.973 | -0.486 | -0.324 |
| -0.106 | -0.975 | -0.487 | -0.325 |
| -0.1055 | -0.977 | -0.488 | -0.326 |
| -0.105 | -0.979 | -0.489 | -0.326 |
| -0.1045 | -0.981 | -0.49 | -0.327 |
| -0.104 | -0.983 | -0.491 | -0.328 |
| -0.1035 | -0.985 | -0.493 | -0.328 |
| -0.103 | -0.987 | -0.494 | -0.329 |
| -0.1025 | -0.989 | -0.495 | -0.33 |
| -0.102 | -0.991 | -0.496 | -0.33 |
| -0.1015 | -0.994 | -0.497 | -0.331 |
| -0.101 | -0.996 | -0.498 | -0.332 |
| -0.1005 | -0.998 | -0.499 | -0.333 |
| -0.0999999999999996 | -1 | -0.5 | -0.333 |
| -0.0994999999999996 | -1.002 | -0.501 | -0.334 |
| -0.0989999999999996 | -1.004 | -0.502 | -0.335 |
| -0.0984999999999996 | -1.007 | -0.503 | -0.336 |
| -0.0979999999999996 | -1.009 | -0.504 | -0.336 |
| -0.0974999999999996 | -1.011 | -0.505 | -0.337 |
| -0.0969999999999996 | -1.013 | -0.507 | -0.338 |
| -0.0964999999999996 | -1.015 | -0.508 | -0.338 |
| -0.0959999999999996 | -1.018 | -0.509 | -0.339 |
| -0.0954999999999996 | -1.02 | -0.51 | -0.34 |
| -0.0949999999999996 | -1.022 | -0.511 | -0.341 |
| -0.0944999999999996 | -1.025 | -0.512 | -0.342 |
| -0.0939999999999996 | -1.027 | -0.513 | -0.342 |
| -0.0934999999999996 | -1.029 | -0.515 | -0.343 |
| -0.0929999999999996 | -1.032 | -0.516 | -0.344 |
| -0.0924999999999996 | -1.034 | -0.517 | -0.345 |
| -0.0919999999999996 | -1.036 | -0.518 | -0.345 |
| -0.0914999999999996 | -1.039 | -0.519 | -0.346 |
| -0.0909999999999996 | -1.041 | -0.52 | -0.347 |
| -0.0904999999999996 | -1.043 | -0.522 | -0.348 |
| -0.0899999999999996 | -1.046 | -0.523 | -0.349 |
| -0.0894999999999996 | -1.048 | -0.524 | -0.349 |
| -0.0889999999999996 | -1.051 | -0.525 | -0.35 |
| -0.0884999999999996 | -1.053 | -0.527 | -0.351 |
| -0.0879999999999996 | -1.056 | -0.528 | -0.352 |
| -0.0874999999999996 | -1.058 | -0.529 | -0.353 |
| -0.0869999999999996 | -1.06 | -0.53 | -0.353 |
| -0.0864999999999996 | -1.063 | -0.531 | -0.354 |
| -0.0859999999999996 | -1.066 | -0.533 | -0.355 |
| -0.0854999999999996 | -1.068 | -0.534 | -0.356 |
| -0.0849999999999996 | -1.071 | -0.535 | -0.357 |
| -0.0844999999999996 | -1.073 | -0.537 | -0.358 |
| -0.0839999999999996 | -1.076 | -0.538 | -0.359 |
| -0.0834999999999996 | -1.078 | -0.539 | -0.359 |
| -0.0829999999999996 | -1.081 | -0.54 | -0.36 |
| -0.0824999999999996 | -1.084 | -0.542 | -0.361 |
| -0.0819999999999996 | -1.086 | -0.543 | -0.362 |
| -0.0814999999999996 | -1.089 | -0.544 | -0.363 |
| -0.0809999999999996 | -1.092 | -0.546 | -0.364 |
| -0.0804999999999996 | -1.094 | -0.547 | -0.365 |
| -0.0799999999999996 | -1.097 | -0.548 | -0.366 |
| -0.0794999999999996 | -1.1 | -0.55 | -0.367 |
| -0.0789999999999996 | -1.102 | -0.551 | -0.367 |
| -0.0784999999999996 | -1.105 | -0.553 | -0.368 |
| -0.0779999999999996 | -1.108 | -0.554 | -0.369 |
| -0.0774999999999996 | -1.111 | -0.555 | -0.37 |
| -0.0769999999999996 | -1.114 | -0.557 | -0.371 |
| -0.0764999999999996 | -1.116 | -0.558 | -0.372 |
| -0.0759999999999996 | -1.119 | -0.56 | -0.373 |
| -0.0754999999999996 | -1.122 | -0.561 | -0.374 |
| -0.0749999999999996 | -1.125 | -0.562 | -0.375 |
| -0.0744999999999996 | -1.128 | -0.564 | -0.376 |
| -0.0739999999999996 | -1.131 | -0.565 | -0.377 |
| -0.0734999999999996 | -1.134 | -0.567 | -0.378 |
| -0.0729999999999996 | -1.137 | -0.568 | -0.379 |
| -0.0724999999999996 | -1.14 | -0.57 | -0.38 |
| -0.0719999999999996 | -1.143 | -0.571 | -0.381 |
| -0.0714999999999996 | -1.146 | -0.573 | -0.382 |
| -0.0709999999999996 | -1.149 | -0.574 | -0.383 |
| -0.0704999999999996 | -1.152 | -0.576 | -0.384 |
| -0.0699999999999996 | -1.155 | -0.577 | -0.385 |
| -0.0694999999999996 | -1.158 | -0.579 | -0.386 |
| -0.0689999999999996 | -1.161 | -0.581 | -0.387 |
| -0.0684999999999996 | -1.164 | -0.582 | -0.388 |
| -0.0679999999999996 | -1.167 | -0.584 | -0.389 |
| -0.0674999999999996 | -1.171 | -0.585 | -0.39 |
| -0.0669999999999996 | -1.174 | -0.587 | -0.391 |
| -0.0664999999999996 | -1.177 | -0.589 | -0.392 |
| -0.0659999999999996 | -1.18 | -0.59 | -0.393 |
| -0.0654999999999996 | -1.184 | -0.592 | -0.395 |
| -0.0649999999999996 | -1.187 | -0.594 | -0.396 |
| -0.0644999999999996 | -1.19 | -0.595 | -0.397 |
| -0.0639999999999996 | -1.194 | -0.597 | -0.398 |
| -0.0634999999999996 | -1.197 | -0.599 | -0.399 |
| -0.0629999999999996 | -1.201 | -0.6 | -0.4 |
| -0.0624999999999996 | -1.204 | -0.602 | -0.401 |
| -0.0619999999999996 | -1.208 | -0.604 | -0.403 |
| -0.0614999999999996 | -1.211 | -0.606 | -0.404 |
| -0.0609999999999996 | -1.215 | -0.607 | -0.405 |
| -0.0604999999999996 | -1.218 | -0.609 | -0.406 |
| -0.0599999999999996 | -1.222 | -0.611 | -0.407 |
| -0.0594999999999996 | -1.225 | -0.613 | -0.408 |
| -0.0589999999999996 | -1.229 | -0.615 | -0.41 |
| -0.0584999999999996 | -1.233 | -0.616 | -0.411 |
| -0.0579999999999996 | -1.237 | -0.618 | -0.412 |
| -0.0574999999999996 | -1.24 | -0.62 | -0.413 |
| -0.0569999999999996 | -1.244 | -0.622 | -0.415 |
| -0.0564999999999996 | -1.248 | -0.624 | -0.416 |
| -0.0559999999999996 | -1.252 | -0.626 | -0.417 |
| -0.0554999999999996 | -1.256 | -0.628 | -0.419 |
| -0.0549999999999996 | -1.26 | -0.63 | -0.42 |
| -0.0544999999999996 | -1.264 | -0.632 | -0.421 |
| -0.0539999999999996 | -1.268 | -0.634 | -0.423 |
| -0.0534999999999996 | -1.272 | -0.636 | -0.424 |
| -0.0529999999999996 | -1.276 | -0.638 | -0.425 |
| -0.0524999999999996 | -1.28 | -0.64 | -0.427 |
| -0.0519999999999996 | -1.284 | -0.642 | -0.428 |
| -0.0514999999999996 | -1.288 | -0.644 | -0.429 |
| -0.0509999999999996 | -1.292 | -0.646 | -0.431 |
| -0.0504999999999996 | -1.297 | -0.648 | -0.432 |
| -0.0499999999999996 | -1.301 | -0.651 | -0.434 |
| -0.0494999999999996 | -1.305 | -0.653 | -0.435 |
| -0.0489999999999996 | -1.31 | -0.655 | -0.437 |
| -0.0484999999999996 | -1.314 | -0.657 | -0.438 |
| -0.0479999999999996 | -1.319 | -0.659 | -0.44 |
| -0.0474999999999996 | -1.323 | -0.662 | -0.441 |
| -0.0469999999999996 | -1.328 | -0.664 | -0.443 |
| -0.0464999999999996 | -1.333 | -0.666 | -0.444 |
| -0.0459999999999996 | -1.337 | -0.669 | -0.446 |
| -0.0454999999999996 | -1.342 | -0.671 | -0.447 |
| -0.0449999999999996 | -1.347 | -0.673 | -0.449 |
| -0.0444999999999996 | -1.352 | -0.676 | -0.451 |
| -0.0439999999999996 | -1.357 | -0.678 | -0.452 |
| -0.0434999999999996 | -1.362 | -0.681 | -0.454 |
| -0.0429999999999996 | -1.367 | -0.683 | -0.456 |
| -0.0424999999999996 | -1.372 | -0.686 | -0.457 |
| -0.0419999999999996 | -1.377 | -0.688 | -0.459 |
| -0.0414999999999996 | -1.382 | -0.691 | -0.461 |
| -0.0409999999999996 | -1.387 | -0.694 | -0.462 |
| -0.0404999999999996 | -1.393 | -0.696 | -0.464 |
| -0.0399999999999996 | -1.398 | -0.699 | -0.466 |
| -0.0394999999999996 | -1.403 | -0.702 | -0.468 |
| -0.0389999999999996 | -1.409 | -0.704 | -0.47 |
| -0.0384999999999996 | -1.415 | -0.707 | -0.472 |
| -0.0379999999999996 | -1.42 | -0.71 | -0.473 |
| -0.0374999999999996 | -1.426 | -0.713 | -0.475 |
| -0.0369999999999996 | -1.432 | -0.716 | -0.477 |
| -0.0364999999999996 | -1.438 | -0.719 | -0.479 |
| -0.0359999999999996 | -1.444 | -0.722 | -0.481 |
| -0.0354999999999996 | -1.45 | -0.725 | -0.483 |
| -0.0349999999999996 | -1.456 | -0.728 | -0.485 |
| -0.0344999999999996 | -1.462 | -0.731 | -0.487 |
| -0.0339999999999996 | -1.469 | -0.734 | -0.49 |
| -0.0334999999999996 | -1.475 | -0.737 | -0.492 |
| -0.0329999999999996 | -1.481 | -0.741 | -0.494 |
| -0.0324999999999996 | -1.488 | -0.744 | -0.496 |
| -0.0319999999999996 | -1.495 | -0.747 | -0.498 |
| -0.0314999999999996 | -1.502 | -0.751 | -0.501 |
| -0.0309999999999996 | -1.509 | -0.754 | -0.503 |
| -0.0304999999999996 | -1.516 | -0.758 | -0.505 |
| -0.0299999999999996 | -1.523 | -0.761 | -0.508 |
| -0.0294999999999996 | -1.53 | -0.765 | -0.51 |
| -0.0289999999999996 | -1.538 | -0.769 | -0.513 |
| -0.0284999999999996 | -1.545 | -0.773 | -0.515 |
| -0.0279999999999996 | -1.553 | -0.776 | -0.518 |
| -0.0274999999999996 | -1.561 | -0.78 | -0.52 |
| -0.0269999999999996 | -1.569 | -0.784 | -0.523 |
| -0.0264999999999996 | -1.577 | -0.788 | -0.526 |
| -0.0259999999999996 | -1.585 | -0.793 | -0.528 |
| -0.0254999999999996 | -1.593 | -0.797 | -0.531 |
| -0.0249999999999996 | -1.602 | -0.801 | -0.534 |
| -0.0244999999999996 | -1.611 | -0.805 | -0.537 |
| -0.0239999999999996 | -1.62 | -0.81 | -0.54 |
| -0.0234999999999996 | -1.629 | -0.814 | -0.543 |
| -0.0229999999999996 | -1.638 | -0.819 | -0.546 |
| -0.0224999999999996 | -1.648 | -0.824 | -0.549 |
| -0.0219999999999996 | -1.658 | -0.829 | -0.553 |
| -0.0214999999999996 | -1.668 | -0.834 | -0.556 |
| -0.0209999999999996 | -1.678 | -0.839 | -0.559 |
| -0.0204999999999996 | -1.688 | -0.844 | -0.563 |
| -0.0199999999999996 | -1.699 | -0.849 | -0.566 |
| -0.0194999999999996 | -1.71 | -0.855 | -0.57 |
| -0.0189999999999996 | -1.721 | -0.861 | -0.574 |
| -0.0184999999999996 | -1.733 | -0.866 | -0.578 |
| -0.0179999999999996 | -1.745 | -0.872 | -0.582 |
| -0.0174999999999996 | -1.757 | -0.878 | -0.586 |
| -0.0169999999999996 | -1.77 | -0.885 | -0.59 |
| -0.0164999999999996 | -1.783 | -0.891 | -0.594 |
| -0.0159999999999996 | -1.796 | -0.898 | -0.599 |
| -0.0154999999999996 | -1.81 | -0.905 | -0.603 |
| -0.0149999999999996 | -1.824 | -0.912 | -0.608 |
| -0.0144999999999996 | -1.839 | -0.919 | -0.613 |
| -0.0139999999999996 | -1.854 | -0.927 | -0.618 |
| -0.0134999999999996 | -1.87 | -0.935 | -0.623 |
| -0.0129999999999996 | -1.886 | -0.943 | -0.629 |
| -0.0124999999999996 | -1.903 | -0.952 | -0.634 |
| -0.0119999999999996 | -1.921 | -0.96 | -0.64 |
| -0.0114999999999996 | -1.939 | -0.97 | -0.646 |
| -0.0109999999999996 | -1.959 | -0.979 | -0.653 |
| -0.0104999999999996 | -1.979 | -0.989 | -0.66 |
| -0.00999999999999956 | -2 | -1 | -0.667 |
| -0.00949999999999956 | -2.022 | -1.011 | -0.674 |
| -0.00899999999999956 | -2.046 | -1.023 | -0.682 |
| -0.00849999999999956 | -2.071 | -1.035 | -0.69 |
| -0.00799999999999956 | -2.097 | -1.048 | -0.699 |
| -0.00749999999999956 | -2.125 | -1.062 | -0.708 |
| -0.00699999999999956 | -2.155 | -1.077 | -0.718 |
| -0.00649999999999956 | -2.187 | -1.094 | -0.729 |
| -0.00599999999999956 | -2.222 | -1.111 | -0.741 |
| -0.00549999999999956 | -2.26 | -1.13 | -0.753 |
| -0.00499999999999956 | -2.301 | -1.151 | -0.767 |
| -0.00449999999999956 | -2.347 | -1.173 | -0.782 |
| -0.00399999999999956 | -2.398 | -1.199 | -0.799 |
| -0.00349999999999956 | -2.456 | -1.228 | -0.819 |
| -0.00299999999999956 | -2.523 | -1.261 | -0.841 |
| -0.00249999999999956 | -2.602 | -1.301 | -0.867 |
| -0.00199999999999956 | -2.699 | -1.349 | -0.9 |
| -0.00149999999999956 | -2.824 | -1.412 | -0.941 |
| -0.000999999999999559 | -3 | -1.5 | -1 |
| -0.000499999999999559 | -3.301 | -1.651 | -1.1 |
| 4.40619762898109e-16 | -15.356 | -7.678 | -5.119 |
| 0.000500000000000441 | -3.301 | -1.651 | -1.1 |
| 0.00100000000000044 | -3 | -1.5 | -1 |
| 0.00150000000000044 | -2.824 | -1.412 | -0.941 |
| 0.00200000000000044 | -2.699 | -1.349 | -0.9 |
| 0.00250000000000044 | -2.602 | -1.301 | -0.867 |
| 0.00300000000000044 | -2.523 | -1.261 | -0.841 |
| 0.00350000000000044 | -2.456 | -1.228 | -0.819 |
| 0.00400000000000044 | -2.398 | -1.199 | -0.799 |
| 0.00450000000000044 | -2.347 | -1.173 | -0.782 |
| 0.00500000000000044 | -2.301 | -1.151 | -0.767 |
| 0.00550000000000044 | -2.26 | -1.13 | -0.753 |
| 0.00600000000000044 | -2.222 | -1.111 | -0.741 |
| 0.00650000000000044 | -2.187 | -1.094 | -0.729 |
| 0.00700000000000044 | -2.155 | -1.077 | -0.718 |
| 0.00750000000000044 | -2.125 | -1.062 | -0.708 |
| 0.00800000000000044 | -2.097 | -1.048 | -0.699 |
| 0.00850000000000044 | -2.071 | -1.035 | -0.69 |
| 0.00900000000000044 | -2.046 | -1.023 | -0.682 |
| 0.00950000000000044 | -2.022 | -1.011 | -0.674 |
| 0.0100000000000004 | -2 | -1 | -0.667 |
| 0.0105000000000004 | -1.979 | -0.989 | -0.66 |
| 0.0110000000000004 | -1.959 | -0.979 | -0.653 |
| 0.0115000000000004 | -1.939 | -0.97 | -0.646 |
| 0.0120000000000004 | -1.921 | -0.96 | -0.64 |
| 0.0125000000000004 | -1.903 | -0.952 | -0.634 |
| 0.0130000000000004 | -1.886 | -0.943 | -0.629 |
| 0.0135000000000004 | -1.87 | -0.935 | -0.623 |
| 0.0140000000000004 | -1.854 | -0.927 | -0.618 |
| 0.0145000000000004 | -1.839 | -0.919 | -0.613 |
| 0.0150000000000004 | -1.824 | -0.912 | -0.608 |
| 0.0155000000000004 | -1.81 | -0.905 | -0.603 |
| 0.0160000000000004 | -1.796 | -0.898 | -0.599 |
| 0.0165000000000004 | -1.783 | -0.891 | -0.594 |
| 0.0170000000000004 | -1.77 | -0.885 | -0.59 |
| 0.0175000000000004 | -1.757 | -0.878 | -0.586 |
| 0.0180000000000004 | -1.745 | -0.872 | -0.582 |
| 0.0185000000000004 | -1.733 | -0.866 | -0.578 |
| 0.0190000000000004 | -1.721 | -0.861 | -0.574 |
| 0.0195000000000004 | -1.71 | -0.855 | -0.57 |
| 0.0200000000000005 | -1.699 | -0.849 | -0.566 |
| 0.0205000000000005 | -1.688 | -0.844 | -0.563 |
| 0.0210000000000005 | -1.678 | -0.839 | -0.559 |
| 0.0215000000000005 | -1.668 | -0.834 | -0.556 |
| 0.0220000000000005 | -1.658 | -0.829 | -0.553 |
| 0.0225000000000005 | -1.648 | -0.824 | -0.549 |
| 0.0230000000000005 | -1.638 | -0.819 | -0.546 |
| 0.0235000000000005 | -1.629 | -0.814 | -0.543 |
| 0.0240000000000005 | -1.62 | -0.81 | -0.54 |
| 0.0245000000000005 | -1.611 | -0.805 | -0.537 |
| 0.0250000000000005 | -1.602 | -0.801 | -0.534 |
| 0.0255000000000005 | -1.593 | -0.797 | -0.531 |
| 0.0260000000000005 | -1.585 | -0.793 | -0.528 |
| 0.0265000000000005 | -1.577 | -0.788 | -0.526 |
| 0.0270000000000005 | -1.569 | -0.784 | -0.523 |
| 0.0275000000000005 | -1.561 | -0.78 | -0.52 |
| 0.0280000000000005 | -1.553 | -0.776 | -0.518 |
| 0.0285000000000005 | -1.545 | -0.773 | -0.515 |
| 0.0290000000000005 | -1.538 | -0.769 | -0.513 |
| 0.0295000000000005 | -1.53 | -0.765 | -0.51 |
| 0.0300000000000005 | -1.523 | -0.761 | -0.508 |
| 0.0305000000000005 | -1.516 | -0.758 | -0.505 |
| 0.0310000000000005 | -1.509 | -0.754 | -0.503 |
| 0.0315000000000005 | -1.502 | -0.751 | -0.501 |
| 0.0320000000000005 | -1.495 | -0.747 | -0.498 |
| 0.0325000000000005 | -1.488 | -0.744 | -0.496 |
| 0.0330000000000005 | -1.481 | -0.741 | -0.494 |
| 0.0335000000000005 | -1.475 | -0.737 | -0.492 |
| 0.0340000000000005 | -1.469 | -0.734 | -0.49 |
| 0.0345000000000005 | -1.462 | -0.731 | -0.487 |
| 0.0350000000000005 | -1.456 | -0.728 | -0.485 |
| 0.0355000000000005 | -1.45 | -0.725 | -0.483 |
| 0.0360000000000005 | -1.444 | -0.722 | -0.481 |
| 0.0365000000000005 | -1.438 | -0.719 | -0.479 |
| 0.0370000000000005 | -1.432 | -0.716 | -0.477 |
| 0.0375000000000005 | -1.426 | -0.713 | -0.475 |
| 0.0380000000000005 | -1.42 | -0.71 | -0.473 |
| 0.0385000000000005 | -1.415 | -0.707 | -0.472 |
| 0.0390000000000005 | -1.409 | -0.704 | -0.47 |
| 0.0395000000000005 | -1.403 | -0.702 | -0.468 |
| 0.0400000000000005 | -1.398 | -0.699 | -0.466 |
| 0.0405000000000005 | -1.393 | -0.696 | -0.464 |
| 0.0410000000000005 | -1.387 | -0.694 | -0.462 |
| 0.0415000000000005 | -1.382 | -0.691 | -0.461 |
| 0.0420000000000005 | -1.377 | -0.688 | -0.459 |
| 0.0425000000000005 | -1.372 | -0.686 | -0.457 |
| 0.0430000000000005 | -1.367 | -0.683 | -0.456 |
| 0.0435000000000005 | -1.362 | -0.681 | -0.454 |
| 0.0440000000000005 | -1.357 | -0.678 | -0.452 |
| 0.0445000000000005 | -1.352 | -0.676 | -0.451 |
| 0.0450000000000005 | -1.347 | -0.673 | -0.449 |
| 0.0455000000000005 | -1.342 | -0.671 | -0.447 |
| 0.0460000000000005 | -1.337 | -0.669 | -0.446 |
| 0.0465000000000005 | -1.333 | -0.666 | -0.444 |
| 0.0470000000000005 | -1.328 | -0.664 | -0.443 |
| 0.0475000000000005 | -1.323 | -0.662 | -0.441 |
| 0.0480000000000005 | -1.319 | -0.659 | -0.44 |
| 0.0485000000000005 | -1.314 | -0.657 | -0.438 |
| 0.0490000000000005 | -1.31 | -0.655 | -0.437 |
| 0.0495000000000005 | -1.305 | -0.653 | -0.435 |
| 0.0500000000000005 | -1.301 | -0.651 | -0.434 |
| 0.0505000000000005 | -1.297 | -0.648 | -0.432 |
| 0.0510000000000005 | -1.292 | -0.646 | -0.431 |
| 0.0515000000000005 | -1.288 | -0.644 | -0.429 |
| 0.0520000000000005 | -1.284 | -0.642 | -0.428 |
| 0.0525000000000005 | -1.28 | -0.64 | -0.427 |
| 0.0530000000000005 | -1.276 | -0.638 | -0.425 |
| 0.0535000000000005 | -1.272 | -0.636 | -0.424 |
| 0.0540000000000005 | -1.268 | -0.634 | -0.423 |
| 0.0545000000000005 | -1.264 | -0.632 | -0.421 |
| 0.0550000000000005 | -1.26 | -0.63 | -0.42 |
| 0.0555000000000005 | -1.256 | -0.628 | -0.419 |
| 0.0560000000000005 | -1.252 | -0.626 | -0.417 |
| 0.0565000000000005 | -1.248 | -0.624 | -0.416 |
| 0.0570000000000005 | -1.244 | -0.622 | -0.415 |
| 0.0575000000000005 | -1.24 | -0.62 | -0.413 |
| 0.0580000000000005 | -1.237 | -0.618 | -0.412 |
| 0.0585000000000005 | -1.233 | -0.616 | -0.411 |
| 0.0590000000000005 | -1.229 | -0.615 | -0.41 |
| 0.0595000000000005 | -1.225 | -0.613 | -0.408 |
| 0.0600000000000005 | -1.222 | -0.611 | -0.407 |
| 0.0605000000000005 | -1.218 | -0.609 | -0.406 |
| 0.0610000000000005 | -1.215 | -0.607 | -0.405 |
| 0.0615000000000005 | -1.211 | -0.606 | -0.404 |
| 0.0620000000000005 | -1.208 | -0.604 | -0.403 |
| 0.0625000000000005 | -1.204 | -0.602 | -0.401 |
| 0.0630000000000005 | -1.201 | -0.6 | -0.4 |
| 0.0635000000000005 | -1.197 | -0.599 | -0.399 |
| 0.0640000000000005 | -1.194 | -0.597 | -0.398 |
| 0.0645000000000005 | -1.19 | -0.595 | -0.397 |
| 0.0650000000000005 | -1.187 | -0.594 | -0.396 |
| 0.0655000000000005 | -1.184 | -0.592 | -0.395 |
| 0.0660000000000005 | -1.18 | -0.59 | -0.393 |
| 0.0665000000000005 | -1.177 | -0.589 | -0.392 |
| 0.0670000000000005 | -1.174 | -0.587 | -0.391 |
| 0.0675000000000005 | -1.171 | -0.585 | -0.39 |
| 0.0680000000000005 | -1.167 | -0.584 | -0.389 |
| 0.0685000000000005 | -1.164 | -0.582 | -0.388 |
| 0.0690000000000005 | -1.161 | -0.581 | -0.387 |
| 0.0695000000000005 | -1.158 | -0.579 | -0.386 |
| 0.0700000000000005 | -1.155 | -0.577 | -0.385 |
| 0.0705000000000005 | -1.152 | -0.576 | -0.384 |
| 0.0710000000000005 | -1.149 | -0.574 | -0.383 |
| 0.0715000000000005 | -1.146 | -0.573 | -0.382 |
| 0.0720000000000005 | -1.143 | -0.571 | -0.381 |
| 0.0725000000000005 | -1.14 | -0.57 | -0.38 |
| 0.0730000000000005 | -1.137 | -0.568 | -0.379 |
| 0.0735000000000005 | -1.134 | -0.567 | -0.378 |
| 0.0740000000000005 | -1.131 | -0.565 | -0.377 |
| 0.0745000000000005 | -1.128 | -0.564 | -0.376 |
| 0.0750000000000005 | -1.125 | -0.562 | -0.375 |
| 0.0755000000000005 | -1.122 | -0.561 | -0.374 |
| 0.0760000000000005 | -1.119 | -0.56 | -0.373 |
| 0.0765000000000005 | -1.116 | -0.558 | -0.372 |
| 0.0770000000000005 | -1.114 | -0.557 | -0.371 |
| 0.0775000000000005 | -1.111 | -0.555 | -0.37 |
| 0.0780000000000005 | -1.108 | -0.554 | -0.369 |
| 0.0785000000000005 | -1.105 | -0.553 | -0.368 |
| 0.0790000000000005 | -1.102 | -0.551 | -0.367 |
| 0.0795000000000005 | -1.1 | -0.55 | -0.367 |
| 0.0800000000000005 | -1.097 | -0.548 | -0.366 |
| 0.0805000000000005 | -1.094 | -0.547 | -0.365 |
| 0.0810000000000005 | -1.092 | -0.546 | -0.364 |
| 0.0815000000000005 | -1.089 | -0.544 | -0.363 |
| 0.0820000000000005 | -1.086 | -0.543 | -0.362 |
| 0.0825000000000005 | -1.084 | -0.542 | -0.361 |
| 0.0830000000000005 | -1.081 | -0.54 | -0.36 |
| 0.0835000000000005 | -1.078 | -0.539 | -0.359 |
| 0.0840000000000005 | -1.076 | -0.538 | -0.359 |
| 0.0845000000000005 | -1.073 | -0.537 | -0.358 |
| 0.0850000000000005 | -1.071 | -0.535 | -0.357 |
| 0.0855000000000005 | -1.068 | -0.534 | -0.356 |
| 0.0860000000000005 | -1.066 | -0.533 | -0.355 |
| 0.0865000000000005 | -1.063 | -0.531 | -0.354 |
| 0.0870000000000005 | -1.06 | -0.53 | -0.353 |
| 0.0875000000000005 | -1.058 | -0.529 | -0.353 |
| 0.0880000000000005 | -1.056 | -0.528 | -0.352 |
| 0.0885000000000005 | -1.053 | -0.527 | -0.351 |
| 0.0890000000000005 | -1.051 | -0.525 | -0.35 |
| 0.0895000000000005 | -1.048 | -0.524 | -0.349 |
| 0.0900000000000005 | -1.046 | -0.523 | -0.349 |
| 0.0905000000000005 | -1.043 | -0.522 | -0.348 |
| 0.0910000000000005 | -1.041 | -0.52 | -0.347 |
| 0.0915000000000005 | -1.039 | -0.519 | -0.346 |
| 0.0920000000000005 | -1.036 | -0.518 | -0.345 |
| 0.0925000000000005 | -1.034 | -0.517 | -0.345 |
| 0.0930000000000005 | -1.032 | -0.516 | -0.344 |
| 0.0935000000000005 | -1.029 | -0.515 | -0.343 |
| 0.0940000000000005 | -1.027 | -0.513 | -0.342 |
| 0.0945000000000005 | -1.025 | -0.512 | -0.342 |
| 0.0950000000000005 | -1.022 | -0.511 | -0.341 |
| 0.0955000000000005 | -1.02 | -0.51 | -0.34 |
| 0.0960000000000005 | -1.018 | -0.509 | -0.339 |
| 0.0965000000000005 | -1.015 | -0.508 | -0.338 |
| 0.0970000000000005 | -1.013 | -0.507 | -0.338 |
| 0.0975000000000005 | -1.011 | -0.505 | -0.337 |
| 0.0980000000000005 | -1.009 | -0.504 | -0.336 |
| 0.0985000000000005 | -1.007 | -0.503 | -0.336 |
| 0.0990000000000005 | -1.004 | -0.502 | -0.335 |
| 0.0995000000000005 | -1.002 | -0.501 | -0.334 |
| 0.100000000000001 | -1 | -0.5 | -0.333 |
| 0.100500000000001 | -0.998 | -0.499 | -0.333 |
| 0.101000000000001 | -0.996 | -0.498 | -0.332 |
| 0.101500000000001 | -0.994 | -0.497 | -0.331 |
| 0.102000000000001 | -0.991 | -0.496 | -0.33 |
| 0.102500000000001 | -0.989 | -0.495 | -0.33 |
| 0.103000000000001 | -0.987 | -0.494 | -0.329 |
| 0.103500000000001 | -0.985 | -0.493 | -0.328 |
| 0.104000000000001 | -0.983 | -0.491 | -0.328 |
| 0.104500000000001 | -0.981 | -0.49 | -0.327 |
| 0.105000000000001 | -0.979 | -0.489 | -0.326 |
| 0.105500000000001 | -0.977 | -0.488 | -0.326 |
| 0.106000000000001 | -0.975 | -0.487 | -0.325 |
| 0.106500000000001 | -0.973 | -0.486 | -0.324 |
| 0.107000000000001 | -0.971 | -0.485 | -0.324 |
| 0.107500000000001 | -0.969 | -0.484 | -0.323 |
| 0.108000000000001 | -0.967 | -0.483 | -0.322 |
| 0.108500000000001 | -0.965 | -0.482 | -0.322 |
| 0.109000000000001 | -0.963 | -0.481 | -0.321 |
| 0.109500000000001 | -0.961 | -0.48 | -0.32 |
| 0.110000000000001 | -0.959 | -0.479 | -0.32 |
| 0.110500000000001 | -0.957 | -0.478 | -0.319 |
| 0.111000000000001 | -0.955 | -0.477 | -0.318 |
| 0.111500000000001 | -0.953 | -0.476 | -0.318 |
| 0.112000000000001 | -0.951 | -0.475 | -0.317 |
| 0.112500000000001 | -0.949 | -0.474 | -0.316 |
| 0.113000000000001 | -0.947 | -0.473 | -0.316 |
| 0.113500000000001 | -0.945 | -0.473 | -0.315 |
| 0.114000000000001 | -0.943 | -0.472 | -0.314 |
| 0.114500000000001 | -0.941 | -0.471 | -0.314 |
| 0.115000000000001 | -0.939 | -0.47 | -0.313 |
| 0.115500000000001 | -0.937 | -0.469 | -0.312 |
| 0.116000000000001 | -0.936 | -0.468 | -0.312 |
| 0.116500000000001 | -0.934 | -0.467 | -0.311 |
| 0.117000000000001 | -0.932 | -0.466 | -0.311 |
| 0.117500000000001 | -0.93 | -0.465 | -0.31 |
| 0.118000000000001 | -0.928 | -0.464 | -0.309 |
| 0.118500000000001 | -0.926 | -0.463 | -0.309 |
| 0.119000000000001 | -0.924 | -0.462 | -0.308 |
| 0.119500000000001 | -0.923 | -0.461 | -0.308 |
| 0.120000000000001 | -0.921 | -0.46 | -0.307 |
| 0.120500000000001 | -0.919 | -0.46 | -0.306 |
| 0.121000000000001 | -0.917 | -0.459 | -0.306 |
| 0.121500000000001 | -0.915 | -0.458 | -0.305 |
| 0.122000000000001 | -0.914 | -0.457 | -0.305 |
| 0.122500000000001 | -0.912 | -0.456 | -0.304 |
| 0.123000000000001 | -0.91 | -0.455 | -0.303 |
| 0.123500000000001 | -0.908 | -0.454 | -0.303 |
| 0.124000000000001 | -0.907 | -0.453 | -0.302 |
| 0.124500000000001 | -0.905 | -0.452 | -0.302 |
| 0.125000000000001 | -0.903 | -0.452 | -0.301 |
| 0.125500000000001 | -0.901 | -0.451 | -0.3 |
| 0.126000000000001 | -0.9 | -0.45 | -0.3 |
| 0.126500000000001 | -0.898 | -0.449 | -0.299 |
| 0.127000000000001 | -0.896 | -0.448 | -0.299 |
| 0.127500000000001 | -0.894 | -0.447 | -0.298 |
| 0.128000000000001 | -0.893 | -0.446 | -0.298 |
| 0.128500000000001 | -0.891 | -0.446 | -0.297 |
| 0.129000000000001 | -0.889 | -0.445 | -0.296 |
| 0.129500000000001 | -0.888 | -0.444 | -0.296 |
| 0.130000000000001 | -0.886 | -0.443 | -0.295 |
| 0.130500000000001 | -0.884 | -0.442 | -0.295 |
| 0.131000000000001 | -0.883 | -0.441 | -0.294 |
| 0.131500000000001 | -0.881 | -0.441 | -0.294 |
| 0.132000000000001 | -0.879 | -0.44 | -0.293 |
| 0.132500000000001 | -0.878 | -0.439 | -0.293 |
| 0.133000000000001 | -0.876 | -0.438 | -0.292 |
| 0.133500000000001 | -0.875 | -0.437 | -0.292 |
| 0.134000000000001 | -0.873 | -0.436 | -0.291 |
| 0.134500000000001 | -0.871 | -0.436 | -0.29 |
| 0.135000000000001 | -0.87 | -0.435 | -0.29 |
| 0.135500000000001 | -0.868 | -0.434 | -0.289 |
| 0.136000000000001 | -0.866 | -0.433 | -0.289 |
| 0.136500000000001 | -0.865 | -0.432 | -0.288 |
| 0.137000000000001 | -0.863 | -0.432 | -0.288 |
| 0.137500000000001 | -0.862 | -0.431 | -0.287 |
| 0.138000000000001 | -0.86 | -0.43 | -0.287 |
| 0.138500000000001 | -0.859 | -0.429 | -0.286 |
| 0.139000000000001 | -0.857 | -0.428 | -0.286 |
| 0.139500000000001 | -0.855 | -0.428 | -0.285 |
| 0.140000000000001 | -0.854 | -0.427 | -0.285 |
| 0.140500000000001 | -0.852 | -0.426 | -0.284 |
| 0.141000000000001 | -0.851 | -0.425 | -0.284 |
| 0.141500000000001 | -0.849 | -0.425 | -0.283 |
| 0.142000000000001 | -0.848 | -0.424 | -0.283 |
| 0.142500000000001 | -0.846 | -0.423 | -0.282 |
| 0.143000000000001 | -0.845 | -0.422 | -0.282 |
| 0.143500000000001 | -0.843 | -0.422 | -0.281 |
| 0.144000000000001 | -0.842 | -0.421 | -0.281 |
| 0.144500000000001 | -0.84 | -0.42 | -0.28 |
| 0.145000000000001 | -0.839 | -0.419 | -0.28 |
| 0.145500000000001 | -0.837 | -0.419 | -0.279 |
| 0.146000000000001 | -0.836 | -0.418 | -0.279 |
| 0.146500000000001 | -0.834 | -0.417 | -0.278 |
| 0.147000000000001 | -0.833 | -0.416 | -0.278 |
| 0.147500000000001 | -0.831 | -0.416 | -0.277 |
| 0.148000000000001 | -0.83 | -0.415 | -0.277 |
| 0.148500000000001 | -0.828 | -0.414 | -0.276 |
| 0.149000000000001 | -0.827 | -0.413 | -0.276 |
| 0.149500000000001 | -0.825 | -0.413 | -0.275 |
| 0.150000000000001 | -0.824 | -0.412 | -0.275 |
| 0.150500000000001 | -0.822 | -0.411 | -0.274 |
| 0.151000000000001 | -0.821 | -0.411 | -0.274 |
| 0.151500000000001 | -0.82 | -0.41 | -0.273 |
| 0.152000000000001 | -0.818 | -0.409 | -0.273 |
| 0.152500000000001 | -0.817 | -0.408 | -0.272 |
| 0.153000000000001 | -0.815 | -0.408 | -0.272 |
| 0.153500000000001 | -0.814 | -0.407 | -0.271 |
| 0.154000000000001 | -0.812 | -0.406 | -0.271 |
| 0.154500000000001 | -0.811 | -0.406 | -0.27 |
| 0.155000000000001 | -0.81 | -0.405 | -0.27 |
| 0.155500000000001 | -0.808 | -0.404 | -0.269 |
| 0.156000000000001 | -0.807 | -0.403 | -0.269 |
| 0.156500000000001 | -0.805 | -0.403 | -0.268 |
| 0.157000000000001 | -0.804 | -0.402 | -0.268 |
| 0.157500000000001 | -0.803 | -0.401 | -0.268 |
| 0.158000000000001 | -0.801 | -0.401 | -0.267 |
| 0.158500000000001 | -0.8 | -0.4 | -0.267 |
| 0.159000000000001 | -0.799 | -0.399 | -0.266 |
| 0.159500000000001 | -0.797 | -0.399 | -0.266 |
| 0.160000000000001 | -0.796 | -0.398 | -0.265 |
| 0.160500000000001 | -0.795 | -0.397 | -0.265 |
| 0.161000000000001 | -0.793 | -0.397 | -0.264 |
| 0.161500000000001 | -0.792 | -0.396 | -0.264 |
| 0.162000000000001 | -0.79 | -0.395 | -0.263 |
| 0.162500000000001 | -0.789 | -0.395 | -0.263 |
| 0.163000000000001 | -0.788 | -0.394 | -0.263 |
| 0.163500000000001 | -0.786 | -0.393 | -0.262 |
| 0.164000000000001 | -0.785 | -0.393 | -0.262 |
| 0.164500000000001 | -0.784 | -0.392 | -0.261 |
| 0.165000000000001 | -0.783 | -0.391 | -0.261 |
| 0.165500000000001 | -0.781 | -0.391 | -0.26 |
| 0.166000000000001 | -0.78 | -0.39 | -0.26 |
| 0.166500000000001 | -0.779 | -0.389 | -0.26 |
| 0.167000000000001 | -0.777 | -0.389 | -0.259 |
| 0.167500000000001 | -0.776 | -0.388 | -0.259 |
| 0.168000000000001 | -0.775 | -0.387 | -0.258 |
| 0.168500000000001 | -0.773 | -0.387 | -0.258 |
| 0.169000000000001 | -0.772 | -0.386 | -0.257 |
| 0.169500000000001 | -0.771 | -0.385 | -0.257 |
| 0.170000000000001 | -0.77 | -0.385 | -0.257 |
| 0.170500000000001 | -0.768 | -0.384 | -0.256 |
| 0.171000000000001 | -0.767 | -0.384 | -0.256 |
| 0.171500000000001 | -0.766 | -0.383 | -0.255 |
| 0.172000000000001 | -0.764 | -0.382 | -0.255 |
| 0.172500000000001 | -0.763 | -0.382 | -0.254 |
| 0.173000000000001 | -0.762 | -0.381 | -0.254 |
| 0.173500000000001 | -0.761 | -0.38 | -0.254 |
| 0.174000000000001 | -0.759 | -0.38 | -0.253 |
| 0.174500000000001 | -0.758 | -0.379 | -0.253 |
| 0.175000000000001 | -0.757 | -0.378 | -0.252 |
| 0.175500000000001 | -0.756 | -0.378 | -0.252 |
| 0.176000000000001 | -0.754 | -0.377 | -0.251 |
| 0.176500000000001 | -0.753 | -0.377 | -0.251 |
| 0.177000000000001 | -0.752 | -0.376 | -0.251 |
| 0.177500000000001 | -0.751 | -0.375 | -0.25 |
| 0.178000000000001 | -0.75 | -0.375 | -0.25 |
| 0.178500000000001 | -0.748 | -0.374 | -0.249 |
| 0.179000000000001 | -0.747 | -0.374 | -0.249 |
| 0.179500000000001 | -0.746 | -0.373 | -0.249 |
| 0.180000000000001 | -0.745 | -0.372 | -0.248 |
| 0.180500000000001 | -0.744 | -0.372 | -0.248 |
| 0.181000000000001 | -0.742 | -0.371 | -0.247 |
| 0.181500000000001 | -0.741 | -0.371 | -0.247 |
| 0.182000000000001 | -0.74 | -0.37 | -0.247 |
| 0.182500000000001 | -0.739 | -0.369 | -0.246 |
| 0.183000000000001 | -0.738 | -0.369 | -0.246 |
| 0.183500000000001 | -0.736 | -0.368 | -0.245 |
| 0.184000000000001 | -0.735 | -0.368 | -0.245 |
| 0.184500000000001 | -0.734 | -0.367 | -0.245 |
| 0.185000000000001 | -0.733 | -0.366 | -0.244 |
| 0.185500000000001 | -0.732 | -0.366 | -0.244 |
| 0.186000000000001 | -0.73 | -0.365 | -0.243 |
| 0.186500000000001 | -0.729 | -0.365 | -0.243 |
| 0.187000000000001 | -0.728 | -0.364 | -0.243 |
| 0.187500000000001 | -0.727 | -0.363 | -0.242 |
| 0.188000000000001 | -0.726 | -0.363 | -0.242 |
| 0.188500000000001 | -0.725 | -0.362 | -0.242 |
| 0.189000000000001 | -0.724 | -0.362 | -0.241 |
| 0.189500000000001 | -0.722 | -0.361 | -0.241 |
| 0.190000000000001 | -0.721 | -0.361 | -0.24 |
| 0.190500000000001 | -0.72 | -0.36 | -0.24 |
| 0.191000000000001 | -0.719 | -0.359 | -0.24 |
| 0.191500000000001 | -0.718 | -0.359 | -0.239 |
| 0.192000000000001 | -0.717 | -0.358 | -0.239 |
| 0.192500000000001 | -0.716 | -0.358 | -0.239 |
| 0.193000000000001 | -0.714 | -0.357 | -0.238 |
| 0.193500000000001 | -0.713 | -0.357 | -0.238 |
| 0.194000000000001 | -0.712 | -0.356 | -0.237 |
| 0.194500000000001 | -0.711 | -0.356 | -0.237 |
| 0.195000000000001 | -0.71 | -0.355 | -0.237 |
| 0.195500000000001 | -0.709 | -0.354 | -0.236 |
| 0.196000000000001 | -0.708 | -0.354 | -0.236 |
| 0.196500000000001 | -0.707 | -0.353 | -0.236 |
| 0.197000000000001 | -0.706 | -0.353 | -0.235 |
| 0.197500000000001 | -0.704 | -0.352 | -0.235 |
| 0.198000000000001 | -0.703 | -0.352 | -0.234 |
| 0.198500000000001 | -0.702 | -0.351 | -0.234 |
| 0.199000000000001 | -0.701 | -0.351 | -0.234 |
| 0.199500000000001 | -0.7 | -0.35 | -0.233 |
| 0.200000000000001 | -0.699 | -0.349 | -0.233 |
| 0.200500000000001 | -0.698 | -0.349 | -0.233 |
| 0.201000000000001 | -0.697 | -0.348 | -0.232 |
| 0.201500000000001 | -0.696 | -0.348 | -0.232 |
| 0.202000000000001 | -0.695 | -0.347 | -0.232 |
| 0.202500000000001 | -0.694 | -0.347 | -0.231 |
| 0.203000000000001 | -0.693 | -0.346 | -0.231 |
| 0.203500000000001 | -0.691 | -0.346 | -0.23 |
| 0.204000000000001 | -0.69 | -0.345 | -0.23 |
| 0.204500000000001 | -0.689 | -0.345 | -0.23 |
| 0.205000000000001 | -0.688 | -0.344 | -0.229 |
| 0.205500000000001 | -0.687 | -0.344 | -0.229 |
| 0.206000000000001 | -0.686 | -0.343 | -0.229 |
| 0.206500000000001 | -0.685 | -0.343 | -0.228 |
| 0.207000000000001 | -0.684 | -0.342 | -0.228 |
| 0.207500000000001 | -0.683 | -0.341 | -0.228 |
| 0.208000000000001 | -0.682 | -0.341 | -0.227 |
| 0.208500000000001 | -0.681 | -0.34 | -0.227 |
| 0.209000000000001 | -0.68 | -0.34 | -0.227 |
| 0.209500000000001 | -0.679 | -0.339 | -0.226 |
| 0.210000000000001 | -0.678 | -0.339 | -0.226 |
| 0.210500000000001 | -0.677 | -0.338 | -0.226 |
| 0.211000000000001 | -0.676 | -0.338 | -0.225 |
| 0.211500000000001 | -0.675 | -0.337 | -0.225 |
| 0.212000000000001 | -0.674 | -0.337 | -0.225 |
| 0.212500000000001 | -0.673 | -0.336 | -0.224 |
| 0.213000000000001 | -0.672 | -0.336 | -0.224 |
| 0.213500000000001 | -0.671 | -0.335 | -0.224 |
| 0.214000000000001 | -0.67 | -0.335 | -0.223 |
| 0.214500000000001 | -0.669 | -0.334 | -0.223 |
| 0.215000000000001 | -0.668 | -0.334 | -0.223 |
| 0.215500000000001 | -0.667 | -0.333 | -0.222 |
| 0.216000000000001 | -0.666 | -0.333 | -0.222 |
| 0.216500000000001 | -0.665 | -0.332 | -0.222 |
| 0.217000000000001 | -0.664 | -0.332 | -0.221 |
| 0.217500000000001 | -0.663 | -0.331 | -0.221 |
| 0.218000000000001 | -0.662 | -0.331 | -0.221 |
| 0.218500000000001 | -0.661 | -0.33 | -0.22 |
| 0.219000000000001 | -0.66 | -0.33 | -0.22 |
| 0.219500000000001 | -0.659 | -0.329 | -0.22 |
| 0.220000000000001 | -0.658 | -0.329 | -0.219 |
| 0.220500000000001 | -0.657 | -0.328 | -0.219 |
| 0.221000000000001 | -0.656 | -0.328 | -0.219 |
| 0.221500000000001 | -0.655 | -0.327 | -0.218 |
| 0.222000000000001 | -0.654 | -0.327 | -0.218 |
| 0.222500000000001 | -0.653 | -0.326 | -0.218 |
| 0.223000000000001 | -0.652 | -0.326 | -0.217 |
| 0.223500000000001 | -0.651 | -0.325 | -0.217 |
| 0.224000000000001 | -0.65 | -0.325 | -0.217 |
| 0.224500000000001 | -0.649 | -0.324 | -0.216 |
| 0.225000000000001 | -0.648 | -0.324 | -0.216 |
| 0.225500000000001 | -0.647 | -0.323 | -0.216 |
| 0.226000000000001 | -0.646 | -0.323 | -0.215 |
| 0.226500000000001 | -0.645 | -0.322 | -0.215 |
| 0.227000000000001 | -0.644 | -0.322 | -0.215 |
| 0.227500000000001 | -0.643 | -0.322 | -0.214 |
| 0.228000000000001 | -0.642 | -0.321 | -0.214 |
| 0.228500000000001 | -0.641 | -0.321 | -0.214 |
| 0.229000000000001 | -0.64 | -0.32 | -0.213 |
| 0.229500000000001 | -0.639 | -0.32 | -0.213 |
| 0.230000000000001 | -0.638 | -0.319 | -0.213 |
| 0.230500000000001 | -0.637 | -0.319 | -0.212 |
| 0.231000000000001 | -0.636 | -0.318 | -0.212 |
| 0.231500000000001 | -0.635 | -0.318 | -0.212 |
| 0.232000000000001 | -0.635 | -0.317 | -0.212 |
| 0.232500000000001 | -0.634 | -0.317 | -0.211 |
| 0.233000000000001 | -0.633 | -0.316 | -0.211 |
| 0.233500000000001 | -0.632 | -0.316 | -0.211 |
| 0.234000000000001 | -0.631 | -0.315 | -0.21 |
| 0.234500000000001 | -0.63 | -0.315 | -0.21 |
| 0.235000000000001 | -0.629 | -0.314 | -0.21 |
| 0.235500000000001 | -0.628 | -0.314 | -0.209 |
| 0.236000000000001 | -0.627 | -0.314 | -0.209 |
| 0.236500000000001 | -0.626 | -0.313 | -0.209 |
| 0.237000000000001 | -0.625 | -0.313 | -0.208 |
| 0.237500000000001 | -0.624 | -0.312 | -0.208 |
| 0.238000000000001 | -0.623 | -0.312 | -0.208 |
| 0.238500000000001 | -0.623 | -0.311 | -0.208 |
| 0.239000000000001 | -0.622 | -0.311 | -0.207 |
| 0.239500000000001 | -0.621 | -0.31 | -0.207 |
| 0.240000000000001 | -0.62 | -0.31 | -0.207 |
| 0.240500000000001 | -0.619 | -0.309 | -0.206 |
| 0.241000000000001 | -0.618 | -0.309 | -0.206 |
| 0.241500000000001 | -0.617 | -0.309 | -0.206 |
| 0.242000000000001 | -0.616 | -0.308 | -0.205 |
| 0.242500000000001 | -0.615 | -0.308 | -0.205 |
| 0.243000000000001 | -0.614 | -0.307 | -0.205 |
| 0.243500000000001 | -0.614 | -0.307 | -0.205 |
| 0.244000000000001 | -0.613 | -0.306 | -0.204 |
| 0.244500000000001 | -0.612 | -0.306 | -0.204 |
| 0.245000000000001 | -0.611 | -0.305 | -0.204 |
| 0.245500000000001 | -0.61 | -0.305 | -0.203 |
| 0.246000000000001 | -0.609 | -0.305 | -0.203 |
| 0.246500000000001 | -0.608 | -0.304 | -0.203 |
| 0.247000000000001 | -0.607 | -0.304 | -0.202 |
| 0.247500000000001 | -0.606 | -0.303 | -0.202 |
| 0.248000000000001 | -0.606 | -0.303 | -0.202 |
| 0.248500000000001 | -0.605 | -0.302 | -0.202 |
| 0.249000000000001 | -0.604 | -0.302 | -0.201 |
| 0.249500000000001 | -0.603 | -0.301 | -0.201 |
| 0.250000000000001 | -0.602 | -0.301 | -0.201 |
| 0.250500000000001 | -0.601 | -0.301 | -0.2 |
| 0.251000000000001 | -0.6 | -0.3 | -0.2 |
| 0.251500000000001 | -0.599 | -0.3 | -0.2 |
| 0.252000000000001 | -0.599 | -0.299 | -0.2 |
| 0.252500000000001 | -0.598 | -0.299 | -0.199 |
| 0.253000000000001 | -0.597 | -0.298 | -0.199 |
| 0.253500000000001 | -0.596 | -0.298 | -0.199 |
| 0.254000000000001 | -0.595 | -0.298 | -0.198 |
| 0.254500000000001 | -0.594 | -0.297 | -0.198 |
| 0.255000000000001 | -0.593 | -0.297 | -0.198 |
| 0.255500000000001 | -0.593 | -0.296 | -0.198 |
| 0.256000000000001 | -0.592 | -0.296 | -0.197 |
| 0.256500000000001 | -0.591 | -0.295 | -0.197 |
| 0.257000000000001 | -0.59 | -0.295 | -0.197 |
| 0.257500000000001 | -0.589 | -0.295 | -0.196 |
| 0.258000000000001 | -0.588 | -0.294 | -0.196 |
| 0.258500000000001 | -0.588 | -0.294 | -0.196 |
| 0.259000000000001 | -0.587 | -0.293 | -0.196 |
| 0.259500000000001 | -0.586 | -0.293 | -0.195 |
| 0.260000000000001 | -0.585 | -0.293 | -0.195 |
| 0.260500000000001 | -0.584 | -0.292 | -0.195 |
| 0.261000000000001 | -0.583 | -0.292 | -0.194 |
| 0.261500000000001 | -0.583 | -0.291 | -0.194 |
| 0.262000000000001 | -0.582 | -0.291 | -0.194 |
| 0.262500000000001 | -0.581 | -0.29 | -0.194 |
| 0.263000000000001 | -0.58 | -0.29 | -0.193 |
| 0.263500000000001 | -0.579 | -0.29 | -0.193 |
| 0.264000000000001 | -0.578 | -0.289 | -0.193 |
| 0.264500000000001 | -0.578 | -0.289 | -0.193 |
| 0.265000000000001 | -0.577 | -0.288 | -0.192 |
| 0.265500000000001 | -0.576 | -0.288 | -0.192 |
| 0.266000000000001 | -0.575 | -0.288 | -0.192 |
| 0.266500000000001 | -0.574 | -0.287 | -0.191 |
| 0.267000000000001 | -0.573 | -0.287 | -0.191 |
| 0.267500000000001 | -0.573 | -0.286 | -0.191 |
| 0.268000000000001 | -0.572 | -0.286 | -0.191 |
| 0.268500000000001 | -0.571 | -0.286 | -0.19 |
| 0.269000000000001 | -0.57 | -0.285 | -0.19 |
| 0.269500000000001 | -0.569 | -0.285 | -0.19 |
| 0.270000000000001 | -0.569 | -0.284 | -0.19 |
| 0.270500000000001 | -0.568 | -0.284 | -0.189 |
| 0.271000000000001 | -0.567 | -0.284 | -0.189 |
| 0.271500000000001 | -0.566 | -0.283 | -0.189 |
| 0.272000000000001 | -0.565 | -0.283 | -0.188 |
| 0.272500000000001 | -0.565 | -0.282 | -0.188 |
| 0.273000000000001 | -0.564 | -0.282 | -0.188 |
| 0.273500000000001 | -0.563 | -0.282 | -0.188 |
| 0.274000000000001 | -0.562 | -0.281 | -0.187 |
| 0.274500000000001 | -0.561 | -0.281 | -0.187 |
| 0.275000000000001 | -0.561 | -0.28 | -0.187 |
| 0.275500000000001 | -0.56 | -0.28 | -0.187 |
| 0.276000000000001 | -0.559 | -0.28 | -0.186 |
| 0.276500000000001 | -0.558 | -0.279 | -0.186 |
| 0.277000000000001 | -0.558 | -0.279 | -0.186 |
| 0.277500000000001 | -0.557 | -0.278 | -0.186 |
| 0.278000000000001 | -0.556 | -0.278 | -0.185 |
| 0.278500000000001 | -0.555 | -0.278 | -0.185 |
| 0.279000000000001 | -0.554 | -0.277 | -0.185 |
| 0.279500000000001 | -0.554 | -0.277 | -0.185 |
| 0.280000000000001 | -0.553 | -0.276 | -0.184 |
| 0.280500000000001 | -0.552 | -0.276 | -0.184 |
| 0.281000000000001 | -0.551 | -0.276 | -0.184 |
| 0.281500000000001 | -0.551 | -0.275 | -0.184 |
| 0.282000000000001 | -0.55 | -0.275 | -0.183 |
| 0.282500000000001 | -0.549 | -0.274 | -0.183 |
| 0.283000000000001 | -0.548 | -0.274 | -0.183 |
| 0.283500000000001 | -0.547 | -0.274 | -0.182 |
| 0.284000000000001 | -0.547 | -0.273 | -0.182 |
| 0.284500000000001 | -0.546 | -0.273 | -0.182 |
| 0.285000000000001 | -0.545 | -0.273 | -0.182 |
| 0.285500000000001 | -0.544 | -0.272 | -0.181 |
| 0.286000000000001 | -0.544 | -0.272 | -0.181 |
| 0.286500000000001 | -0.543 | -0.271 | -0.181 |
| 0.287000000000001 | -0.542 | -0.271 | -0.181 |
| 0.287500000000001 | -0.541 | -0.271 | -0.18 |
| 0.288000000000001 | -0.541 | -0.27 | -0.18 |
| 0.288500000000001 | -0.54 | -0.27 | -0.18 |
| 0.289000000000001 | -0.539 | -0.27 | -0.18 |
| 0.289500000000001 | -0.538 | -0.269 | -0.179 |
| 0.290000000000001 | -0.538 | -0.269 | -0.179 |
| 0.290500000000001 | -0.537 | -0.268 | -0.179 |
| 0.291000000000001 | -0.536 | -0.268 | -0.179 |
| 0.291500000000001 | -0.535 | -0.268 | -0.178 |
| 0.292000000000001 | -0.535 | -0.267 | -0.178 |
| 0.292500000000001 | -0.534 | -0.267 | -0.178 |
| 0.293000000000001 | -0.533 | -0.267 | -0.178 |
| 0.293500000000001 | -0.532 | -0.266 | -0.177 |
| 0.294000000000001 | -0.532 | -0.266 | -0.177 |
| 0.294500000000001 | -0.531 | -0.265 | -0.177 |
| 0.295000000000001 | -0.53 | -0.265 | -0.177 |
| 0.295500000000001 | -0.529 | -0.265 | -0.176 |
| 0.296000000000001 | -0.529 | -0.264 | -0.176 |
| 0.296500000000001 | -0.528 | -0.264 | -0.176 |
| 0.297000000000001 | -0.527 | -0.264 | -0.176 |
| 0.297500000000001 | -0.527 | -0.263 | -0.176 |
| 0.298000000000001 | -0.526 | -0.263 | -0.175 |
| 0.298500000000001 | -0.525 | -0.263 | -0.175 |
| 0.299000000000001 | -0.524 | -0.262 | -0.175 |
| 0.299500000000001 | -0.524 | -0.262 | -0.175 |
| 0.300000000000001 | -0.523 | -0.261 | -0.174 |
| 0.300500000000001 | -0.522 | -0.261 | -0.174 |
| 0.301000000000001 | -0.521 | -0.261 | -0.174 |
| 0.301500000000001 | -0.521 | -0.26 | -0.174 |
| 0.302000000000001 | -0.52 | -0.26 | -0.173 |
| 0.302500000000001 | -0.519 | -0.26 | -0.173 |
| 0.303000000000001 | -0.519 | -0.259 | -0.173 |
| 0.303500000000001 | -0.518 | -0.259 | -0.173 |
| 0.304000000000001 | -0.517 | -0.259 | -0.172 |
| 0.304500000000001 | -0.516 | -0.258 | -0.172 |
| 0.305000000000001 | -0.516 | -0.258 | -0.172 |
| 0.305500000000001 | -0.515 | -0.257 | -0.172 |
| 0.306000000000001 | -0.514 | -0.257 | -0.171 |
| 0.306500000000001 | -0.514 | -0.257 | -0.171 |
| 0.307000000000001 | -0.513 | -0.256 | -0.171 |
| 0.307500000000001 | -0.512 | -0.256 | -0.171 |
| 0.308000000000001 | -0.511 | -0.256 | -0.17 |
| 0.308500000000001 | -0.511 | -0.255 | -0.17 |
| 0.309000000000001 | -0.51 | -0.255 | -0.17 |
| 0.309500000000001 | -0.509 | -0.255 | -0.17 |
| 0.310000000000001 | -0.509 | -0.254 | -0.17 |
| 0.310500000000001 | -0.508 | -0.254 | -0.169 |
| 0.311000000000001 | -0.507 | -0.254 | -0.169 |
| 0.311500000000001 | -0.507 | -0.253 | -0.169 |
| 0.312000000000001 | -0.506 | -0.253 | -0.169 |
| 0.312500000000001 | -0.505 | -0.253 | -0.168 |
| 0.313000000000001 | -0.504 | -0.252 | -0.168 |
| 0.313500000000001 | -0.504 | -0.252 | -0.168 |
| 0.314000000000001 | -0.503 | -0.252 | -0.168 |
| 0.314500000000001 | -0.502 | -0.251 | -0.167 |
| 0.315000000000001 | -0.502 | -0.251 | -0.167 |
| 0.315500000000001 | -0.501 | -0.251 | -0.167 |
| 0.316000000000001 | -0.5 | -0.25 | -0.167 |
| 0.316500000000001 | -0.5 | -0.25 | -0.167 |
| 0.317000000000001 | -0.499 | -0.249 | -0.166 |
| 0.317500000000001 | -0.498 | -0.249 | -0.166 |
| 0.318000000000001 | -0.498 | -0.249 | -0.166 |
| 0.318500000000001 | -0.497 | -0.248 | -0.166 |
| 0.319000000000001 | -0.496 | -0.248 | -0.165 |
| 0.319500000000001 | -0.496 | -0.248 | -0.165 |
| 0.320000000000001 | -0.495 | -0.247 | -0.165 |
| 0.320500000000001 | -0.494 | -0.247 | -0.165 |
| 0.321000000000001 | -0.493 | -0.247 | -0.164 |
| 0.321500000000001 | -0.493 | -0.246 | -0.164 |
| 0.322000000000001 | -0.492 | -0.246 | -0.164 |
| 0.322500000000001 | -0.491 | -0.246 | -0.164 |
| 0.323000000000001 | -0.491 | -0.245 | -0.164 |
| 0.323500000000001 | -0.49 | -0.245 | -0.163 |
| 0.324000000000001 | -0.489 | -0.245 | -0.163 |
| 0.324500000000001 | -0.489 | -0.244 | -0.163 |
| 0.325000000000001 | -0.488 | -0.244 | -0.163 |
| 0.325500000000001 | -0.487 | -0.244 | -0.162 |
| 0.326000000000001 | -0.487 | -0.243 | -0.162 |
| 0.326500000000001 | -0.486 | -0.243 | -0.162 |
| 0.327000000000001 | -0.485 | -0.243 | -0.162 |
| 0.327500000000001 | -0.485 | -0.242 | -0.162 |
| 0.328000000000001 | -0.484 | -0.242 | -0.161 |
| 0.328500000000001 | -0.483 | -0.242 | -0.161 |
| 0.329000000000001 | -0.483 | -0.241 | -0.161 |
| 0.329500000000001 | -0.482 | -0.241 | -0.161 |
| 0.330000000000001 | -0.481 | -0.241 | -0.16 |
| 0.330500000000001 | -0.481 | -0.24 | -0.16 |
| 0.331000000000001 | -0.48 | -0.24 | -0.16 |
| 0.331500000000001 | -0.48 | -0.24 | -0.16 |
| 0.332000000000001 | -0.479 | -0.239 | -0.16 |
| 0.332500000000001 | -0.478 | -0.239 | -0.159 |
| 0.333000000000001 | -0.478 | -0.239 | -0.159 |
| 0.333500000000001 | -0.477 | -0.238 | -0.159 |
| 0.334000000000001 | -0.476 | -0.238 | -0.159 |
| 0.334500000000001 | -0.476 | -0.238 | -0.159 |
| 0.335000000000001 | -0.475 | -0.237 | -0.158 |
| 0.335500000000001 | -0.474 | -0.237 | -0.158 |
| 0.336000000000001 | -0.474 | -0.237 | -0.158 |
| 0.336500000000001 | -0.473 | -0.237 | -0.158 |
| 0.337000000000001 | -0.472 | -0.236 | -0.157 |
| 0.337500000000001 | -0.472 | -0.236 | -0.157 |
| 0.338000000000001 | -0.471 | -0.236 | -0.157 |
| 0.338500000000001 | -0.47 | -0.235 | -0.157 |
| 0.339000000000001 | -0.47 | -0.235 | -0.157 |
| 0.339500000000001 | -0.469 | -0.235 | -0.156 |
| 0.340000000000001 | -0.469 | -0.234 | -0.156 |
| 0.340500000000001 | -0.468 | -0.234 | -0.156 |
| 0.341000000000001 | -0.467 | -0.234 | -0.156 |
| 0.341500000000001 | -0.467 | -0.233 | -0.156 |
| 0.342000000000001 | -0.466 | -0.233 | -0.155 |
| 0.342500000000001 | -0.465 | -0.233 | -0.155 |
| 0.343000000000001 | -0.465 | -0.232 | -0.155 |
| 0.343500000000001 | -0.464 | -0.232 | -0.155 |
| 0.344000000000001 | -0.463 | -0.232 | -0.154 |
| 0.344500000000001 | -0.463 | -0.231 | -0.154 |
| 0.345000000000001 | -0.462 | -0.231 | -0.154 |
| 0.345500000000001 | -0.462 | -0.231 | -0.154 |
| 0.346000000000001 | -0.461 | -0.23 | -0.154 |
| 0.346500000000001 | -0.46 | -0.23 | -0.153 |
| 0.347000000000001 | -0.46 | -0.23 | -0.153 |
| 0.347500000000001 | -0.459 | -0.23 | -0.153 |
| 0.348000000000001 | -0.458 | -0.229 | -0.153 |
| 0.348500000000001 | -0.458 | -0.229 | -0.153 |
| 0.349000000000001 | -0.457 | -0.229 | -0.152 |
| 0.349500000000001 | -0.457 | -0.228 | -0.152 |
| 0.350000000000001 | -0.456 | -0.228 | -0.152 |
| 0.350500000000001 | -0.455 | -0.228 | -0.152 |
| 0.351000000000001 | -0.455 | -0.227 | -0.152 |
| 0.351500000000001 | -0.454 | -0.227 | -0.151 |
| 0.352000000000001 | -0.453 | -0.227 | -0.151 |
| 0.352500000000001 | -0.453 | -0.226 | -0.151 |
| 0.353000000000001 | -0.452 | -0.226 | -0.151 |
| 0.353500000000001 | -0.452 | -0.226 | -0.151 |
| 0.354000000000001 | -0.451 | -0.225 | -0.15 |
| 0.354500000000001 | -0.45 | -0.225 | -0.15 |
| 0.355000000000001 | -0.45 | -0.225 | -0.15 |
| 0.355500000000001 | -0.449 | -0.225 | -0.15 |
| 0.356000000000001 | -0.449 | -0.224 | -0.15 |
| 0.356500000000001 | -0.448 | -0.224 | -0.149 |
| 0.357000000000001 | -0.447 | -0.224 | -0.149 |
| 0.357500000000001 | -0.447 | -0.223 | -0.149 |
| 0.358000000000001 | -0.446 | -0.223 | -0.149 |
| 0.358500000000001 | -0.446 | -0.223 | -0.149 |
| 0.359000000000001 | -0.445 | -0.222 | -0.148 |
| 0.359500000000001 | -0.444 | -0.222 | -0.148 |
| 0.360000000000001 | -0.444 | -0.222 | -0.148 |
| 0.360500000000001 | -0.443 | -0.222 | -0.148 |
| 0.361000000000001 | -0.442 | -0.221 | -0.147 |
| 0.361500000000001 | -0.442 | -0.221 | -0.147 |
| 0.362000000000001 | -0.441 | -0.221 | -0.147 |
| 0.362500000000001 | -0.441 | -0.22 | -0.147 |
| 0.363000000000001 | -0.44 | -0.22 | -0.147 |
| 0.363500000000001 | -0.439 | -0.22 | -0.146 |
| 0.364000000000001 | -0.439 | -0.219 | -0.146 |
| 0.364500000000001 | -0.438 | -0.219 | -0.146 |
| 0.365000000000001 | -0.438 | -0.219 | -0.146 |
| 0.365500000000001 | -0.437 | -0.219 | -0.146 |
| 0.366000000000001 | -0.437 | -0.218 | -0.146 |
| 0.366500000000001 | -0.436 | -0.218 | -0.145 |
| 0.367000000000001 | -0.435 | -0.218 | -0.145 |
| 0.367500000000001 | -0.435 | -0.217 | -0.145 |
| 0.368000000000001 | -0.434 | -0.217 | -0.145 |
| 0.368500000000001 | -0.434 | -0.217 | -0.145 |
| 0.369000000000001 | -0.433 | -0.216 | -0.144 |
| 0.369500000000001 | -0.432 | -0.216 | -0.144 |
| 0.370000000000001 | -0.432 | -0.216 | -0.144 |
| 0.370500000000001 | -0.431 | -0.216 | -0.144 |
| 0.371000000000001 | -0.431 | -0.215 | -0.144 |
| 0.371500000000001 | -0.43 | -0.215 | -0.143 |
| 0.372000000000001 | -0.429 | -0.215 | -0.143 |
| 0.372500000000001 | -0.429 | -0.214 | -0.143 |
| 0.373000000000001 | -0.428 | -0.214 | -0.143 |
| 0.373500000000001 | -0.428 | -0.214 | -0.143 |
| 0.374000000000001 | -0.427 | -0.214 | -0.142 |
| 0.374500000000001 | -0.427 | -0.213 | -0.142 |
| 0.375000000000001 | -0.426 | -0.213 | -0.142 |
| 0.375500000000001 | -0.425 | -0.213 | -0.142 |
| 0.376000000000001 | -0.425 | -0.212 | -0.142 |
| 0.376500000000001 | -0.424 | -0.212 | -0.141 |
| 0.377000000000001 | -0.424 | -0.212 | -0.141 |
| 0.377500000000001 | -0.423 | -0.212 | -0.141 |
| 0.378000000000001 | -0.423 | -0.211 | -0.141 |
| 0.378500000000001 | -0.422 | -0.211 | -0.141 |
| 0.379000000000001 | -0.421 | -0.211 | -0.14 |
| 0.379500000000001 | -0.421 | -0.21 | -0.14 |
| 0.380000000000001 | -0.42 | -0.21 | -0.14 |
| 0.380500000000001 | -0.42 | -0.21 | -0.14 |
| 0.381000000000001 | -0.419 | -0.21 | -0.14 |
| 0.381500000000001 | -0.419 | -0.209 | -0.14 |
| 0.382000000000001 | -0.418 | -0.209 | -0.139 |
| 0.382500000000001 | -0.417 | -0.209 | -0.139 |
| 0.383000000000001 | -0.417 | -0.208 | -0.139 |
| 0.383500000000001 | -0.416 | -0.208 | -0.139 |
| 0.384000000000001 | -0.416 | -0.208 | -0.139 |
| 0.384500000000001 | -0.415 | -0.208 | -0.138 |
| 0.385000000000001 | -0.415 | -0.207 | -0.138 |
| 0.385500000000001 | -0.414 | -0.207 | -0.138 |
| 0.386000000000001 | -0.413 | -0.207 | -0.138 |
| 0.386500000000001 | -0.413 | -0.206 | -0.138 |
| 0.387000000000001 | -0.412 | -0.206 | -0.137 |
| 0.387500000000001 | -0.412 | -0.206 | -0.137 |
| 0.388000000000001 | -0.411 | -0.206 | -0.137 |
| 0.388500000000001 | -0.411 | -0.205 | -0.137 |
| 0.389000000000001 | -0.41 | -0.205 | -0.137 |
| 0.389500000000001 | -0.409 | -0.205 | -0.136 |
| 0.390000000000001 | -0.409 | -0.204 | -0.136 |
| 0.390500000000001 | -0.408 | -0.204 | -0.136 |
| 0.391000000000001 | -0.408 | -0.204 | -0.136 |
| 0.391500000000001 | -0.407 | -0.204 | -0.136 |
| 0.392000000000001 | -0.407 | -0.203 | -0.136 |
| 0.392500000000001 | -0.406 | -0.203 | -0.135 |
| 0.393000000000001 | -0.406 | -0.203 | -0.135 |
| 0.393500000000001 | -0.405 | -0.203 | -0.135 |
| 0.394000000000001 | -0.405 | -0.202 | -0.135 |
| 0.394500000000001 | -0.404 | -0.202 | -0.135 |
| 0.395000000000001 | -0.403 | -0.202 | -0.134 |
| 0.395500000000001 | -0.403 | -0.201 | -0.134 |
| 0.396000000000001 | -0.402 | -0.201 | -0.134 |
| 0.396500000000001 | -0.402 | -0.201 | -0.134 |
| 0.397000000000001 | -0.401 | -0.201 | -0.134 |
| 0.397500000000001 | -0.401 | -0.2 | -0.134 |
| 0.398000000000001 | -0.4 | -0.2 | -0.133 |
| 0.398500000000001 | -0.4 | -0.2 | -0.133 |
| 0.399000000000001 | -0.399 | -0.2 | -0.133 |
| 0.399500000000001 | -0.398 | -0.199 | -0.133 |
| 0.400000000000001 | -0.398 | -0.199 | -0.133 |
| 0.400500000000001 | -0.397 | -0.199 | -0.132 |
| 0.401000000000001 | -0.397 | -0.198 | -0.132 |
| 0.401500000000001 | -0.396 | -0.198 | -0.132 |
| 0.402000000000001 | -0.396 | -0.198 | -0.132 |
| 0.402500000000001 | -0.395 | -0.198 | -0.132 |
| 0.403000000000001 | -0.395 | -0.197 | -0.132 |
| 0.403500000000001 | -0.394 | -0.197 | -0.131 |
| 0.404000000000001 | -0.394 | -0.197 | -0.131 |
| 0.404500000000001 | -0.393 | -0.197 | -0.131 |
| 0.405000000000001 | -0.393 | -0.196 | -0.131 |
| 0.405500000000001 | -0.392 | -0.196 | -0.131 |
| 0.406000000000001 | -0.391 | -0.196 | -0.13 |
| 0.406500000000001 | -0.391 | -0.195 | -0.13 |
| 0.407000000000001 | -0.39 | -0.195 | -0.13 |
| 0.407500000000001 | -0.39 | -0.195 | -0.13 |
| 0.408000000000001 | -0.389 | -0.195 | -0.13 |
| 0.408500000000001 | -0.389 | -0.194 | -0.13 |
| 0.409000000000001 | -0.388 | -0.194 | -0.129 |
| 0.409500000000001 | -0.388 | -0.194 | -0.129 |
| 0.410000000000001 | -0.387 | -0.194 | -0.129 |
| 0.410500000000001 | -0.387 | -0.193 | -0.129 |
| 0.411000000000001 | -0.386 | -0.193 | -0.129 |
| 0.411500000000001 | -0.386 | -0.193 | -0.129 |
| 0.412000000000001 | -0.385 | -0.193 | -0.128 |
| 0.412500000000001 | -0.385 | -0.192 | -0.128 |
| 0.413000000000001 | -0.384 | -0.192 | -0.128 |
| 0.413500000000001 | -0.384 | -0.192 | -0.128 |
| 0.414000000000001 | -0.383 | -0.191 | -0.128 |
| 0.414500000000001 | -0.382 | -0.191 | -0.127 |
| 0.415000000000001 | -0.382 | -0.191 | -0.127 |
| 0.415500000000001 | -0.381 | -0.191 | -0.127 |
| 0.416000000000001 | -0.381 | -0.19 | -0.127 |
| 0.416500000000001 | -0.38 | -0.19 | -0.127 |
| 0.417000000000001 | -0.38 | -0.19 | -0.127 |
| 0.417500000000001 | -0.379 | -0.19 | -0.126 |
| 0.418000000000001 | -0.379 | -0.189 | -0.126 |
| 0.418500000000001 | -0.378 | -0.189 | -0.126 |
| 0.419000000000001 | -0.378 | -0.189 | -0.126 |
| 0.419500000000001 | -0.377 | -0.189 | -0.126 |
| 0.420000000000001 | -0.377 | -0.188 | -0.126 |
| 0.420500000000001 | -0.376 | -0.188 | -0.125 |
| 0.421000000000001 | -0.376 | -0.188 | -0.125 |
| 0.421500000000001 | -0.375 | -0.188 | -0.125 |
| 0.422000000000001 | -0.375 | -0.187 | -0.125 |
| 0.422500000000001 | -0.374 | -0.187 | -0.125 |
| 0.423000000000001 | -0.374 | -0.187 | -0.125 |
| 0.423500000000001 | -0.373 | -0.187 | -0.124 |
| 0.424000000000001 | -0.373 | -0.186 | -0.124 |
| 0.424500000000001 | -0.372 | -0.186 | -0.124 |
| 0.425000000000001 | -0.372 | -0.186 | -0.124 |
| 0.425500000000001 | -0.371 | -0.186 | -0.124 |
| 0.426000000000001 | -0.371 | -0.185 | -0.124 |
| 0.426500000000001 | -0.37 | -0.185 | -0.123 |
| 0.427000000000001 | -0.37 | -0.185 | -0.123 |
| 0.427500000000001 | -0.369 | -0.185 | -0.123 |
| 0.428000000000001 | -0.369 | -0.184 | -0.123 |
| 0.428500000000001 | -0.368 | -0.184 | -0.123 |
| 0.429000000000001 | -0.368 | -0.184 | -0.123 |
| 0.429500000000001 | -0.367 | -0.184 | -0.122 |
| 0.430000000000001 | -0.367 | -0.183 | -0.122 |
| 0.430500000000001 | -0.366 | -0.183 | -0.122 |
| 0.431000000000001 | -0.366 | -0.183 | -0.122 |
| 0.431500000000001 | -0.365 | -0.183 | -0.122 |
| 0.432000000000001 | -0.365 | -0.182 | -0.122 |
| 0.432500000000001 | -0.364 | -0.182 | -0.121 |
| 0.433000000000001 | -0.364 | -0.182 | -0.121 |
| 0.433500000000001 | -0.363 | -0.182 | -0.121 |
| 0.434000000000001 | -0.363 | -0.181 | -0.121 |
| 0.434500000000001 | -0.362 | -0.181 | -0.121 |
| 0.435000000000001 | -0.362 | -0.181 | -0.121 |
| 0.435500000000001 | -0.361 | -0.181 | -0.12 |
| 0.436000000000001 | -0.361 | -0.18 | -0.12 |
| 0.436500000000001 | -0.36 | -0.18 | -0.12 |
| 0.437000000000001 | -0.36 | -0.18 | -0.12 |
| 0.437500000000001 | -0.359 | -0.18 | -0.12 |
| 0.438000000000001 | -0.359 | -0.179 | -0.12 |
| 0.438500000000001 | -0.358 | -0.179 | -0.119 |
| 0.439000000000001 | -0.358 | -0.179 | -0.119 |
| 0.439500000000001 | -0.357 | -0.179 | -0.119 |
| 0.440000000000001 | -0.357 | -0.178 | -0.119 |
| 0.440500000000001 | -0.356 | -0.178 | -0.119 |
| 0.441000000000001 | -0.356 | -0.178 | -0.119 |
| 0.441500000000001 | -0.355 | -0.178 | -0.118 |
| 0.442000000000001 | -0.355 | -0.177 | -0.118 |
| 0.442500000000001 | -0.354 | -0.177 | -0.118 |
| 0.443000000000001 | -0.354 | -0.177 | -0.118 |
| 0.443500000000001 | -0.353 | -0.177 | -0.118 |
| 0.444000000000001 | -0.353 | -0.176 | -0.118 |
| 0.444500000000001 | -0.352 | -0.176 | -0.117 |
| 0.445000000000001 | -0.352 | -0.176 | -0.117 |
| 0.445500000000001 | -0.351 | -0.176 | -0.117 |
| 0.446000000000001 | -0.351 | -0.175 | -0.117 |
| 0.446500000000001 | -0.35 | -0.175 | -0.117 |
| 0.447000000000001 | -0.35 | -0.175 | -0.117 |
| 0.447500000000001 | -0.349 | -0.175 | -0.116 |
| 0.448000000000001 | -0.349 | -0.174 | -0.116 |
| 0.448500000000001 | -0.348 | -0.174 | -0.116 |
| 0.449000000000001 | -0.348 | -0.174 | -0.116 |
| 0.449500000000001 | -0.347 | -0.174 | -0.116 |
| 0.450000000000001 | -0.347 | -0.173 | -0.116 |
| 0.450500000000001 | -0.346 | -0.173 | -0.115 |
| 0.451000000000001 | -0.346 | -0.173 | -0.115 |
| 0.451500000000001 | -0.345 | -0.173 | -0.115 |
| 0.452000000000001 | -0.345 | -0.172 | -0.115 |
| 0.452500000000001 | -0.344 | -0.172 | -0.115 |
| 0.453000000000001 | -0.344 | -0.172 | -0.115 |
| 0.453500000000001 | -0.343 | -0.172 | -0.114 |
| 0.454000000000001 | -0.343 | -0.171 | -0.114 |
| 0.454500000000001 | -0.342 | -0.171 | -0.114 |
| 0.455000000000001 | -0.342 | -0.171 | -0.114 |
| 0.455500000000001 | -0.342 | -0.171 | -0.114 |
| 0.456000000000001 | -0.341 | -0.171 | -0.114 |
| 0.456500000000001 | -0.341 | -0.17 | -0.114 |
| 0.457000000000001 | -0.34 | -0.17 | -0.113 |
| 0.457500000000001 | -0.34 | -0.17 | -0.113 |
| 0.458000000000001 | -0.339 | -0.17 | -0.113 |
| 0.458500000000001 | -0.339 | -0.169 | -0.113 |
| 0.459000000000001 | -0.338 | -0.169 | -0.113 |
| 0.459500000000001 | -0.338 | -0.169 | -0.113 |
| 0.460000000000001 | -0.337 | -0.169 | -0.112 |
| 0.460500000000001 | -0.337 | -0.168 | -0.112 |
| 0.461000000000001 | -0.336 | -0.168 | -0.112 |
| 0.461500000000001 | -0.336 | -0.168 | -0.112 |
| 0.462000000000001 | -0.335 | -0.168 | -0.112 |
| 0.462500000000001 | -0.335 | -0.167 | -0.112 |
| 0.463000000000001 | -0.334 | -0.167 | -0.111 |
| 0.463500000000001 | -0.334 | -0.167 | -0.111 |
| 0.464000000000001 | -0.333 | -0.167 | -0.111 |
| 0.464500000000001 | -0.333 | -0.167 | -0.111 |
| 0.465000000000001 | -0.333 | -0.166 | -0.111 |
| 0.465500000000001 | -0.332 | -0.166 | -0.111 |
| 0.466000000000001 | -0.332 | -0.166 | -0.111 |
| 0.466500000000001 | -0.331 | -0.166 | -0.11 |
| 0.467000000000001 | -0.331 | -0.165 | -0.11 |
| 0.467500000000001 | -0.33 | -0.165 | -0.11 |
| 0.468000000000001 | -0.33 | -0.165 | -0.11 |
| 0.468500000000001 | -0.329 | -0.165 | -0.11 |
| 0.469000000000001 | -0.329 | -0.164 | -0.11 |
| 0.469500000000001 | -0.328 | -0.164 | -0.109 |
| 0.470000000000001 | -0.328 | -0.164 | -0.109 |
| 0.470500000000001 | -0.327 | -0.164 | -0.109 |
| 0.471000000000001 | -0.327 | -0.163 | -0.109 |
| 0.471500000000001 | -0.327 | -0.163 | -0.109 |
| 0.472000000000001 | -0.326 | -0.163 | -0.109 |
| 0.472500000000001 | -0.326 | -0.163 | -0.109 |
| 0.473000000000001 | -0.325 | -0.163 | -0.108 |
| 0.473500000000001 | -0.325 | -0.162 | -0.108 |
| 0.474000000000001 | -0.324 | -0.162 | -0.108 |
| 0.474500000000001 | -0.324 | -0.162 | -0.108 |
| 0.475000000000001 | -0.323 | -0.162 | -0.108 |
| 0.475500000000001 | -0.323 | -0.161 | -0.108 |
| 0.476000000000001 | -0.322 | -0.161 | -0.107 |
| 0.476500000000001 | -0.322 | -0.161 | -0.107 |
| 0.477000000000001 | -0.321 | -0.161 | -0.107 |
| 0.477500000000001 | -0.321 | -0.161 | -0.107 |
| 0.478000000000001 | -0.321 | -0.16 | -0.107 |
| 0.478500000000001 | -0.32 | -0.16 | -0.107 |
| 0.479000000000001 | -0.32 | -0.16 | -0.107 |
| 0.479500000000001 | -0.319 | -0.16 | -0.106 |
| 0.480000000000001 | -0.319 | -0.159 | -0.106 |
| 0.480500000000001 | -0.318 | -0.159 | -0.106 |
| 0.481000000000001 | -0.318 | -0.159 | -0.106 |
| 0.481500000000001 | -0.317 | -0.159 | -0.106 |
| 0.482000000000001 | -0.317 | -0.158 | -0.106 |
| 0.482500000000001 | -0.317 | -0.158 | -0.106 |
| 0.483000000000001 | -0.316 | -0.158 | -0.105 |
| 0.483500000000001 | -0.316 | -0.158 | -0.105 |
| 0.484000000000001 | -0.315 | -0.158 | -0.105 |
| 0.484500000000001 | -0.315 | -0.157 | -0.105 |
| 0.485000000000001 | -0.314 | -0.157 | -0.105 |
| 0.485500000000001 | -0.314 | -0.157 | -0.105 |
| 0.486000000000001 | -0.313 | -0.157 | -0.104 |
| 0.486500000000001 | -0.313 | -0.156 | -0.104 |
| 0.487000000000001 | -0.312 | -0.156 | -0.104 |
| 0.487500000000001 | -0.312 | -0.156 | -0.104 |
| 0.488000000000001 | -0.312 | -0.156 | -0.104 |
| 0.488500000000001 | -0.311 | -0.156 | -0.104 |
| 0.489000000000001 | -0.311 | -0.155 | -0.104 |
| 0.489500000000001 | -0.31 | -0.155 | -0.103 |
| 0.490000000000001 | -0.31 | -0.155 | -0.103 |
| 0.490500000000001 | -0.309 | -0.155 | -0.103 |
| 0.491000000000001 | -0.309 | -0.154 | -0.103 |
| 0.491500000000001 | -0.308 | -0.154 | -0.103 |
| 0.492000000000001 | -0.308 | -0.154 | -0.103 |
| 0.492500000000001 | -0.308 | -0.154 | -0.103 |
| 0.493000000000001 | -0.307 | -0.154 | -0.102 |
| 0.493500000000001 | -0.307 | -0.153 | -0.102 |
| 0.494000000000001 | -0.306 | -0.153 | -0.102 |
| 0.494500000000001 | -0.306 | -0.153 | -0.102 |
| 0.495000000000001 | -0.305 | -0.153 | -0.102 |
| 0.495500000000001 | -0.305 | -0.152 | -0.102 |
| 0.496000000000001 | -0.305 | -0.152 | -0.102 |
| 0.496500000000001 | -0.304 | -0.152 | -0.101 |
| 0.497000000000001 | -0.304 | -0.152 | -0.101 |
| 0.497500000000001 | -0.303 | -0.152 | -0.101 |
| 0.498000000000001 | -0.303 | -0.151 | -0.101 |
| 0.498500000000001 | -0.302 | -0.151 | -0.101 |
| 0.499000000000001 | -0.302 | -0.151 | -0.101 |
| 0.499500000000001 | -0.301 | -0.151 | -0.1 |
| 0.500000000000001 | -0.301 | -0.151 | -0.1 |